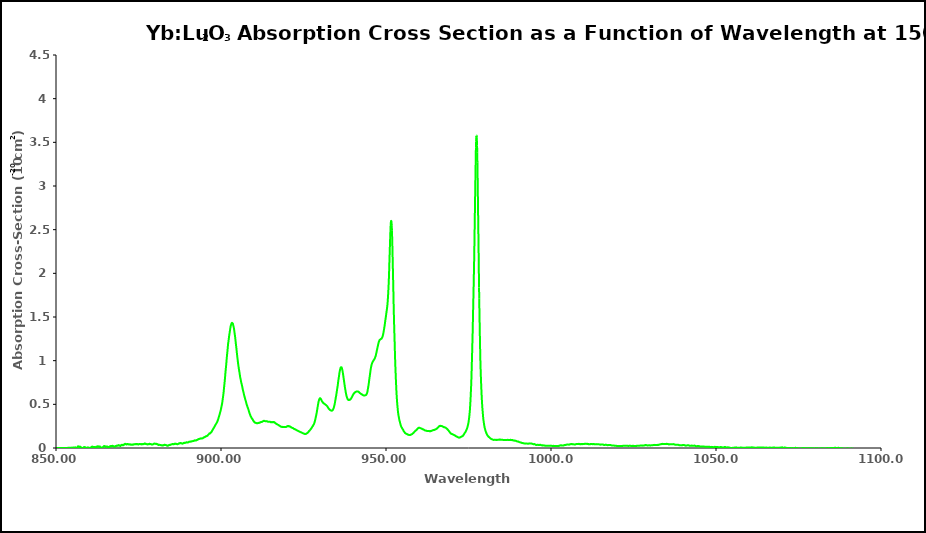
| Category | 150 K |
|---|---|
| 850.0 | 0.002 |
| 850.05 | -0.001 |
| 850.1 | -0.005 |
| 850.15 | -0.011 |
| 850.2 | -0.014 |
| 850.25 | -0.021 |
| 850.3 | -0.023 |
| 850.35 | -0.019 |
| 850.4 | -0.019 |
| 850.45 | -0.02 |
| 850.5 | -0.022 |
| 850.55 | -0.022 |
| 850.6 | -0.021 |
| 850.65 | -0.022 |
| 850.7 | -0.023 |
| 850.75 | -0.025 |
| 850.8 | -0.022 |
| 850.85 | -0.021 |
| 850.9 | -0.022 |
| 850.95 | -0.023 |
| 851.0 | -0.025 |
| 851.05 | -0.023 |
| 851.1 | -0.027 |
| 851.15 | -0.033 |
| 851.2 | -0.033 |
| 851.25 | -0.032 |
| 851.3 | -0.032 |
| 851.35 | -0.031 |
| 851.4 | -0.037 |
| 851.45 | -0.033 |
| 851.5 | -0.032 |
| 851.55 | -0.035 |
| 851.6 | -0.034 |
| 851.65 | -0.029 |
| 851.7 | -0.027 |
| 851.75 | -0.024 |
| 851.8 | -0.021 |
| 851.85 | -0.018 |
| 851.9 | -0.016 |
| 851.95 | -0.012 |
| 852.0 | -0.016 |
| 852.05 | -0.016 |
| 852.1 | -0.012 |
| 852.15 | -0.016 |
| 852.2 | -0.015 |
| 852.25 | -0.014 |
| 852.3 | -0.014 |
| 852.35 | -0.016 |
| 852.4 | -0.015 |
| 852.45 | -0.015 |
| 852.5 | -0.017 |
| 852.55 | -0.016 |
| 852.6 | -0.014 |
| 852.65 | -0.016 |
| 852.7 | -0.013 |
| 852.75 | -0.013 |
| 852.8 | -0.012 |
| 852.85 | -0.012 |
| 852.9 | -0.009 |
| 852.95 | -0.013 |
| 853.0 | -0.017 |
| 853.05 | -0.016 |
| 853.1 | -0.016 |
| 853.15 | -0.015 |
| 853.2 | -0.013 |
| 853.25 | -0.013 |
| 853.3 | -0.019 |
| 853.35 | -0.019 |
| 853.4 | -0.016 |
| 853.45 | -0.019 |
| 853.5 | -0.019 |
| 853.55 | -0.015 |
| 853.6 | -0.017 |
| 853.65 | -0.018 |
| 853.7 | -0.017 |
| 853.75 | -0.015 |
| 853.8 | -0.018 |
| 853.85 | -0.012 |
| 853.9 | -0.013 |
| 853.95 | -0.017 |
| 854.0 | -0.012 |
| 854.05 | -0.01 |
| 854.1 | -0.01 |
| 854.15 | -0.009 |
| 854.2 | -0.011 |
| 854.25 | -0.011 |
| 854.3 | -0.01 |
| 854.35 | -0.007 |
| 854.4 | -0.008 |
| 854.45 | -0.005 |
| 854.5 | -0.005 |
| 854.55 | -0.007 |
| 854.6 | -0.007 |
| 854.65 | -0.005 |
| 854.7 | -0.002 |
| 854.75 | 0.002 |
| 854.8 | 0.003 |
| 854.85 | 0 |
| 854.9 | 0.003 |
| 854.95 | 0.004 |
| 855.0 | 0.003 |
| 855.05 | 0.004 |
| 855.1 | 0.003 |
| 855.15 | 0.005 |
| 855.2 | 0.005 |
| 855.25 | 0.002 |
| 855.3 | 0.001 |
| 855.35 | 0.001 |
| 855.4 | 0.005 |
| 855.45 | 0.003 |
| 855.5 | 0.002 |
| 855.55 | 0.001 |
| 855.6 | 0.001 |
| 855.65 | 0.007 |
| 855.7 | 0.003 |
| 855.75 | 0.005 |
| 855.8 | 0.006 |
| 855.85 | 0.008 |
| 855.9 | 0.006 |
| 855.95 | 0.001 |
| 856.0 | -0.002 |
| 856.05 | 0 |
| 856.1 | 0 |
| 856.15 | -0.001 |
| 856.2 | -0.005 |
| 856.25 | -0.001 |
| 856.3 | -0.001 |
| 856.35 | -0.001 |
| 856.4 | 0.001 |
| 856.45 | 0.004 |
| 856.5 | 0.008 |
| 856.55 | 0.015 |
| 856.6 | 0.015 |
| 856.65 | 0.016 |
| 856.7 | 0.02 |
| 856.75 | 0.016 |
| 856.8 | 0.016 |
| 856.85 | 0.016 |
| 856.9 | 0.018 |
| 856.95 | 0.013 |
| 857.0 | 0.014 |
| 857.05 | 0.014 |
| 857.1 | 0.01 |
| 857.15 | 0.009 |
| 857.2 | 0.01 |
| 857.25 | 0.012 |
| 857.3 | 0.017 |
| 857.35 | 0.013 |
| 857.4 | 0.013 |
| 857.45 | 0.01 |
| 857.5 | 0.011 |
| 857.55 | 0.009 |
| 857.6 | 0.004 |
| 857.65 | 0.004 |
| 857.7 | 0.003 |
| 857.75 | 0.003 |
| 857.8 | -0.006 |
| 857.85 | -0.007 |
| 857.9 | -0.007 |
| 857.95 | -0.008 |
| 858.0 | -0.008 |
| 858.05 | -0.007 |
| 858.1 | -0.004 |
| 858.15 | 0.001 |
| 858.2 | 0.002 |
| 858.25 | 0.001 |
| 858.3 | 0 |
| 858.35 | 0.003 |
| 858.4 | 0.004 |
| 858.45 | 0.007 |
| 858.5 | 0.009 |
| 858.55 | 0.013 |
| 858.6 | 0.011 |
| 858.65 | 0.01 |
| 858.7 | 0.007 |
| 858.75 | 0.005 |
| 858.8 | 0.008 |
| 858.85 | 0.008 |
| 858.9 | 0.008 |
| 858.95 | 0.006 |
| 859.0 | 0.005 |
| 859.05 | -0.002 |
| 859.1 | 0 |
| 859.15 | 0 |
| 859.2 | -0.001 |
| 859.25 | -0.001 |
| 859.3 | -0.002 |
| 859.35 | -0.004 |
| 859.4 | -0.001 |
| 859.45 | 0.002 |
| 859.5 | 0.003 |
| 859.55 | 0.003 |
| 859.6 | 0.007 |
| 859.65 | 0.003 |
| 859.7 | 0.004 |
| 859.75 | 0.002 |
| 859.8 | 0.003 |
| 859.85 | 0.005 |
| 859.9 | 0.005 |
| 859.95 | 0.002 |
| 860.0 | -0.001 |
| 860.05 | 0 |
| 860.1 | 0 |
| 860.15 | -0.002 |
| 860.2 | -0.002 |
| 860.25 | -0.001 |
| 860.3 | 0.002 |
| 860.35 | 0.001 |
| 860.4 | 0.002 |
| 860.45 | 0.003 |
| 860.5 | 0.002 |
| 860.55 | 0.006 |
| 860.6 | 0.007 |
| 860.65 | 0.008 |
| 860.7 | 0.007 |
| 860.75 | 0.011 |
| 860.8 | 0.013 |
| 860.85 | 0.014 |
| 860.9 | 0.014 |
| 860.95 | 0.012 |
| 861.0 | 0.013 |
| 861.05 | 0.016 |
| 861.1 | 0.015 |
| 861.15 | 0.014 |
| 861.2 | 0.012 |
| 861.25 | 0.013 |
| 861.3 | 0.012 |
| 861.35 | 0.009 |
| 861.4 | 0.008 |
| 861.45 | 0.007 |
| 861.5 | 0.011 |
| 861.55 | 0.009 |
| 861.6 | 0.007 |
| 861.65 | 0.008 |
| 861.7 | 0.01 |
| 861.75 | 0.012 |
| 861.8 | 0.01 |
| 861.85 | 0.01 |
| 861.9 | 0.009 |
| 861.95 | 0.01 |
| 862.0 | 0.011 |
| 862.05 | 0.011 |
| 862.1 | 0.013 |
| 862.15 | 0.013 |
| 862.2 | 0.011 |
| 862.25 | 0.01 |
| 862.3 | 0.01 |
| 862.35 | 0.014 |
| 862.4 | 0.014 |
| 862.45 | 0.017 |
| 862.5 | 0.019 |
| 862.55 | 0.019 |
| 862.6 | 0.016 |
| 862.65 | 0.015 |
| 862.7 | 0.016 |
| 862.75 | 0.016 |
| 862.8 | 0.016 |
| 862.85 | 0.017 |
| 862.9 | 0.017 |
| 862.95 | 0.019 |
| 863.0 | 0.015 |
| 863.05 | 0.014 |
| 863.1 | 0.013 |
| 863.15 | 0.014 |
| 863.2 | 0.015 |
| 863.25 | 0.014 |
| 863.3 | 0.018 |
| 863.35 | 0.014 |
| 863.4 | 0.01 |
| 863.45 | 0.008 |
| 863.5 | 0.007 |
| 863.55 | 0.009 |
| 863.6 | 0.007 |
| 863.65 | 0.005 |
| 863.7 | 0.005 |
| 863.75 | 0.001 |
| 863.8 | 0.003 |
| 863.85 | 0 |
| 863.9 | 0.003 |
| 863.95 | 0.005 |
| 864.0 | 0.004 |
| 864.05 | 0.003 |
| 864.1 | 0.005 |
| 864.15 | 0.008 |
| 864.2 | 0.01 |
| 864.25 | 0.012 |
| 864.3 | 0.012 |
| 864.35 | 0.015 |
| 864.4 | 0.018 |
| 864.45 | 0.019 |
| 864.5 | 0.02 |
| 864.55 | 0.021 |
| 864.6 | 0.023 |
| 864.65 | 0.019 |
| 864.7 | 0.018 |
| 864.75 | 0.018 |
| 864.8 | 0.018 |
| 864.85 | 0.019 |
| 864.9 | 0.016 |
| 864.95 | 0.015 |
| 865.0 | 0.015 |
| 865.05 | 0.014 |
| 865.1 | 0.015 |
| 865.15 | 0.016 |
| 865.2 | 0.017 |
| 865.25 | 0.017 |
| 865.3 | 0.017 |
| 865.35 | 0.017 |
| 865.4 | 0.018 |
| 865.45 | 0.016 |
| 865.5 | 0.014 |
| 865.55 | 0.012 |
| 865.6 | 0.016 |
| 865.65 | 0.014 |
| 865.7 | 0.012 |
| 865.75 | 0.011 |
| 865.8 | 0.01 |
| 865.85 | 0.009 |
| 865.9 | 0.011 |
| 865.95 | 0.009 |
| 866.0 | 0.011 |
| 866.05 | 0.012 |
| 866.1 | 0.01 |
| 866.15 | 0.011 |
| 866.2 | 0.011 |
| 866.25 | 0.015 |
| 866.3 | 0.018 |
| 866.35 | 0.018 |
| 866.4 | 0.021 |
| 866.45 | 0.019 |
| 866.5 | 0.021 |
| 866.55 | 0.02 |
| 866.6 | 0.021 |
| 866.65 | 0.024 |
| 866.7 | 0.021 |
| 866.75 | 0.022 |
| 866.8 | 0.021 |
| 866.85 | 0.022 |
| 866.9 | 0.02 |
| 866.95 | 0.021 |
| 867.0 | 0.022 |
| 867.05 | 0.023 |
| 867.1 | 0.025 |
| 867.15 | 0.024 |
| 867.2 | 0.024 |
| 867.25 | 0.024 |
| 867.3 | 0.021 |
| 867.35 | 0.019 |
| 867.4 | 0.017 |
| 867.45 | 0.02 |
| 867.5 | 0.019 |
| 867.55 | 0.015 |
| 867.6 | 0.015 |
| 867.65 | 0.015 |
| 867.7 | 0.016 |
| 867.75 | 0.016 |
| 867.8 | 0.014 |
| 867.85 | 0.017 |
| 867.9 | 0.018 |
| 867.95 | 0.017 |
| 868.0 | 0.019 |
| 868.05 | 0.021 |
| 868.1 | 0.024 |
| 868.15 | 0.023 |
| 868.2 | 0.022 |
| 868.25 | 0.025 |
| 868.3 | 0.024 |
| 868.35 | 0.025 |
| 868.4 | 0.025 |
| 868.45 | 0.027 |
| 868.5 | 0.027 |
| 868.55 | 0.028 |
| 868.6 | 0.026 |
| 868.65 | 0.028 |
| 868.7 | 0.027 |
| 868.75 | 0.029 |
| 868.8 | 0.027 |
| 868.85 | 0.028 |
| 868.9 | 0.028 |
| 868.95 | 0.033 |
| 869.0 | 0.033 |
| 869.05 | 0.033 |
| 869.1 | 0.03 |
| 869.15 | 0.03 |
| 869.2 | 0.027 |
| 869.25 | 0.028 |
| 869.3 | 0.027 |
| 869.35 | 0.026 |
| 869.4 | 0.025 |
| 869.45 | 0.026 |
| 869.5 | 0.024 |
| 869.55 | 0.024 |
| 869.6 | 0.028 |
| 869.65 | 0.031 |
| 869.7 | 0.03 |
| 869.75 | 0.033 |
| 869.8 | 0.033 |
| 869.85 | 0.035 |
| 869.9 | 0.036 |
| 869.95 | 0.036 |
| 870.0 | 0.037 |
| 870.05 | 0.034 |
| 870.1 | 0.032 |
| 870.15 | 0.033 |
| 870.2 | 0.031 |
| 870.25 | 0.033 |
| 870.3 | 0.032 |
| 870.35 | 0.031 |
| 870.4 | 0.032 |
| 870.45 | 0.033 |
| 870.5 | 0.034 |
| 870.55 | 0.036 |
| 870.6 | 0.041 |
| 870.65 | 0.042 |
| 870.7 | 0.041 |
| 870.75 | 0.044 |
| 870.8 | 0.045 |
| 870.85 | 0.046 |
| 870.9 | 0.045 |
| 870.95 | 0.048 |
| 871.0 | 0.047 |
| 871.05 | 0.046 |
| 871.1 | 0.044 |
| 871.15 | 0.042 |
| 871.2 | 0.043 |
| 871.25 | 0.042 |
| 871.3 | 0.041 |
| 871.35 | 0.04 |
| 871.4 | 0.042 |
| 871.45 | 0.045 |
| 871.5 | 0.044 |
| 871.55 | 0.045 |
| 871.6 | 0.047 |
| 871.65 | 0.046 |
| 871.7 | 0.043 |
| 871.75 | 0.044 |
| 871.8 | 0.042 |
| 871.85 | 0.044 |
| 871.9 | 0.044 |
| 871.95 | 0.044 |
| 872.0 | 0.042 |
| 872.05 | 0.04 |
| 872.1 | 0.039 |
| 872.15 | 0.04 |
| 872.2 | 0.039 |
| 872.25 | 0.04 |
| 872.3 | 0.041 |
| 872.35 | 0.043 |
| 872.4 | 0.043 |
| 872.45 | 0.042 |
| 872.5 | 0.039 |
| 872.55 | 0.039 |
| 872.6 | 0.039 |
| 872.65 | 0.038 |
| 872.7 | 0.038 |
| 872.75 | 0.04 |
| 872.8 | 0.041 |
| 872.85 | 0.039 |
| 872.9 | 0.039 |
| 872.95 | 0.037 |
| 873.0 | 0.038 |
| 873.05 | 0.036 |
| 873.1 | 0.039 |
| 873.15 | 0.039 |
| 873.2 | 0.041 |
| 873.25 | 0.039 |
| 873.3 | 0.039 |
| 873.35 | 0.038 |
| 873.4 | 0.039 |
| 873.45 | 0.04 |
| 873.5 | 0.039 |
| 873.55 | 0.04 |
| 873.6 | 0.044 |
| 873.65 | 0.043 |
| 873.7 | 0.044 |
| 873.75 | 0.045 |
| 873.8 | 0.043 |
| 873.85 | 0.043 |
| 873.9 | 0.044 |
| 873.95 | 0.042 |
| 874.0 | 0.042 |
| 874.05 | 0.045 |
| 874.1 | 0.042 |
| 874.15 | 0.043 |
| 874.2 | 0.043 |
| 874.25 | 0.043 |
| 874.3 | 0.042 |
| 874.35 | 0.046 |
| 874.4 | 0.045 |
| 874.45 | 0.046 |
| 874.5 | 0.047 |
| 874.55 | 0.045 |
| 874.6 | 0.045 |
| 874.65 | 0.046 |
| 874.7 | 0.044 |
| 874.75 | 0.044 |
| 874.8 | 0.042 |
| 874.85 | 0.042 |
| 874.9 | 0.039 |
| 874.95 | 0.04 |
| 875.0 | 0.04 |
| 875.05 | 0.043 |
| 875.1 | 0.042 |
| 875.15 | 0.042 |
| 875.2 | 0.044 |
| 875.25 | 0.047 |
| 875.3 | 0.045 |
| 875.35 | 0.047 |
| 875.4 | 0.045 |
| 875.45 | 0.046 |
| 875.5 | 0.046 |
| 875.55 | 0.046 |
| 875.6 | 0.044 |
| 875.65 | 0.044 |
| 875.7 | 0.042 |
| 875.75 | 0.041 |
| 875.8 | 0.042 |
| 875.85 | 0.043 |
| 875.9 | 0.041 |
| 875.95 | 0.044 |
| 876.0 | 0.045 |
| 876.05 | 0.043 |
| 876.1 | 0.045 |
| 876.15 | 0.045 |
| 876.2 | 0.045 |
| 876.25 | 0.045 |
| 876.3 | 0.043 |
| 876.35 | 0.042 |
| 876.4 | 0.043 |
| 876.45 | 0.045 |
| 876.5 | 0.045 |
| 876.55 | 0.045 |
| 876.6 | 0.047 |
| 876.65 | 0.045 |
| 876.7 | 0.046 |
| 876.75 | 0.049 |
| 876.8 | 0.051 |
| 876.85 | 0.053 |
| 876.9 | 0.053 |
| 876.95 | 0.052 |
| 877.0 | 0.052 |
| 877.05 | 0.05 |
| 877.1 | 0.048 |
| 877.15 | 0.046 |
| 877.2 | 0.048 |
| 877.25 | 0.048 |
| 877.3 | 0.045 |
| 877.35 | 0.046 |
| 877.4 | 0.044 |
| 877.45 | 0.044 |
| 877.5 | 0.044 |
| 877.55 | 0.042 |
| 877.6 | 0.042 |
| 877.65 | 0.041 |
| 877.7 | 0.043 |
| 877.75 | 0.041 |
| 877.8 | 0.042 |
| 877.85 | 0.045 |
| 877.9 | 0.045 |
| 877.95 | 0.042 |
| 878.0 | 0.042 |
| 878.05 | 0.042 |
| 878.1 | 0.042 |
| 878.15 | 0.044 |
| 878.2 | 0.046 |
| 878.25 | 0.047 |
| 878.3 | 0.049 |
| 878.35 | 0.047 |
| 878.4 | 0.047 |
| 878.45 | 0.044 |
| 878.5 | 0.046 |
| 878.55 | 0.046 |
| 878.6 | 0.046 |
| 878.65 | 0.047 |
| 878.7 | 0.045 |
| 878.75 | 0.046 |
| 878.8 | 0.042 |
| 878.85 | 0.041 |
| 878.9 | 0.042 |
| 878.95 | 0.04 |
| 879.0 | 0.041 |
| 879.05 | 0.04 |
| 879.1 | 0.041 |
| 879.15 | 0.041 |
| 879.2 | 0.041 |
| 879.25 | 0.041 |
| 879.3 | 0.04 |
| 879.35 | 0.042 |
| 879.4 | 0.044 |
| 879.45 | 0.044 |
| 879.5 | 0.044 |
| 879.55 | 0.046 |
| 879.6 | 0.048 |
| 879.65 | 0.048 |
| 879.7 | 0.049 |
| 879.75 | 0.048 |
| 879.8 | 0.048 |
| 879.85 | 0.05 |
| 879.9 | 0.05 |
| 879.95 | 0.049 |
| 880.0 | 0.049 |
| 880.05 | 0.049 |
| 880.1 | 0.049 |
| 880.15 | 0.048 |
| 880.2 | 0.049 |
| 880.25 | 0.046 |
| 880.3 | 0.047 |
| 880.35 | 0.048 |
| 880.4 | 0.048 |
| 880.45 | 0.048 |
| 880.5 | 0.046 |
| 880.55 | 0.047 |
| 880.6 | 0.046 |
| 880.65 | 0.043 |
| 880.7 | 0.044 |
| 880.75 | 0.042 |
| 880.8 | 0.044 |
| 880.85 | 0.041 |
| 880.9 | 0.039 |
| 880.95 | 0.036 |
| 881.0 | 0.035 |
| 881.05 | 0.034 |
| 881.1 | 0.036 |
| 881.15 | 0.037 |
| 881.2 | 0.038 |
| 881.25 | 0.038 |
| 881.3 | 0.039 |
| 881.35 | 0.036 |
| 881.4 | 0.037 |
| 881.45 | 0.036 |
| 881.5 | 0.036 |
| 881.55 | 0.035 |
| 881.6 | 0.035 |
| 881.65 | 0.034 |
| 881.7 | 0.033 |
| 881.75 | 0.034 |
| 881.8 | 0.032 |
| 881.85 | 0.032 |
| 881.9 | 0.032 |
| 881.95 | 0.032 |
| 882.0 | 0.033 |
| 882.05 | 0.03 |
| 882.1 | 0.03 |
| 882.15 | 0.031 |
| 882.2 | 0.029 |
| 882.25 | 0.031 |
| 882.3 | 0.028 |
| 882.35 | 0.029 |
| 882.4 | 0.029 |
| 882.45 | 0.029 |
| 882.5 | 0.03 |
| 882.55 | 0.031 |
| 882.6 | 0.034 |
| 882.65 | 0.034 |
| 882.7 | 0.033 |
| 882.75 | 0.035 |
| 882.8 | 0.034 |
| 882.85 | 0.037 |
| 882.9 | 0.035 |
| 882.95 | 0.035 |
| 883.0 | 0.037 |
| 883.05 | 0.034 |
| 883.1 | 0.035 |
| 883.15 | 0.034 |
| 883.2 | 0.034 |
| 883.25 | 0.035 |
| 883.3 | 0.033 |
| 883.35 | 0.033 |
| 883.4 | 0.033 |
| 883.45 | 0.032 |
| 883.5 | 0.032 |
| 883.55 | 0.029 |
| 883.6 | 0.029 |
| 883.65 | 0.026 |
| 883.7 | 0.026 |
| 883.75 | 0.026 |
| 883.8 | 0.026 |
| 883.85 | 0.027 |
| 883.9 | 0.028 |
| 883.95 | 0.026 |
| 884.0 | 0.028 |
| 884.05 | 0.03 |
| 884.1 | 0.03 |
| 884.15 | 0.032 |
| 884.2 | 0.032 |
| 884.25 | 0.033 |
| 884.3 | 0.035 |
| 884.35 | 0.035 |
| 884.4 | 0.034 |
| 884.45 | 0.035 |
| 884.5 | 0.036 |
| 884.55 | 0.036 |
| 884.6 | 0.035 |
| 884.65 | 0.037 |
| 884.7 | 0.037 |
| 884.75 | 0.039 |
| 884.8 | 0.039 |
| 884.85 | 0.039 |
| 884.9 | 0.039 |
| 884.95 | 0.041 |
| 885.0 | 0.042 |
| 885.05 | 0.042 |
| 885.1 | 0.043 |
| 885.15 | 0.044 |
| 885.2 | 0.044 |
| 885.25 | 0.045 |
| 885.3 | 0.045 |
| 885.35 | 0.044 |
| 885.4 | 0.045 |
| 885.45 | 0.046 |
| 885.5 | 0.046 |
| 885.55 | 0.045 |
| 885.6 | 0.041 |
| 885.65 | 0.043 |
| 885.7 | 0.044 |
| 885.75 | 0.044 |
| 885.8 | 0.046 |
| 885.85 | 0.047 |
| 885.9 | 0.048 |
| 885.95 | 0.047 |
| 886.0 | 0.047 |
| 886.05 | 0.047 |
| 886.1 | 0.047 |
| 886.15 | 0.05 |
| 886.2 | 0.049 |
| 886.25 | 0.05 |
| 886.3 | 0.048 |
| 886.35 | 0.047 |
| 886.4 | 0.047 |
| 886.45 | 0.047 |
| 886.5 | 0.046 |
| 886.55 | 0.046 |
| 886.6 | 0.045 |
| 886.65 | 0.044 |
| 886.7 | 0.043 |
| 886.75 | 0.042 |
| 886.8 | 0.043 |
| 886.85 | 0.043 |
| 886.9 | 0.045 |
| 886.95 | 0.045 |
| 887.0 | 0.046 |
| 887.05 | 0.047 |
| 887.1 | 0.047 |
| 887.15 | 0.05 |
| 887.2 | 0.052 |
| 887.25 | 0.053 |
| 887.3 | 0.054 |
| 887.35 | 0.052 |
| 887.4 | 0.053 |
| 887.45 | 0.053 |
| 887.5 | 0.053 |
| 887.55 | 0.055 |
| 887.6 | 0.055 |
| 887.65 | 0.057 |
| 887.7 | 0.055 |
| 887.75 | 0.055 |
| 887.8 | 0.054 |
| 887.85 | 0.056 |
| 887.9 | 0.057 |
| 887.95 | 0.055 |
| 888.0 | 0.054 |
| 888.05 | 0.053 |
| 888.1 | 0.051 |
| 888.15 | 0.052 |
| 888.2 | 0.051 |
| 888.25 | 0.05 |
| 888.3 | 0.049 |
| 888.35 | 0.051 |
| 888.4 | 0.051 |
| 888.45 | 0.051 |
| 888.5 | 0.053 |
| 888.55 | 0.053 |
| 888.6 | 0.055 |
| 888.65 | 0.057 |
| 888.7 | 0.057 |
| 888.75 | 0.056 |
| 888.8 | 0.059 |
| 888.85 | 0.06 |
| 888.9 | 0.059 |
| 888.95 | 0.058 |
| 889.0 | 0.058 |
| 889.05 | 0.058 |
| 889.1 | 0.06 |
| 889.15 | 0.059 |
| 889.2 | 0.059 |
| 889.25 | 0.06 |
| 889.3 | 0.06 |
| 889.35 | 0.062 |
| 889.4 | 0.062 |
| 889.45 | 0.064 |
| 889.5 | 0.064 |
| 889.55 | 0.066 |
| 889.6 | 0.066 |
| 889.65 | 0.064 |
| 889.7 | 0.063 |
| 889.75 | 0.062 |
| 889.8 | 0.063 |
| 889.85 | 0.063 |
| 889.9 | 0.062 |
| 889.95 | 0.063 |
| 890.0 | 0.065 |
| 890.05 | 0.066 |
| 890.1 | 0.065 |
| 890.15 | 0.066 |
| 890.2 | 0.068 |
| 890.25 | 0.069 |
| 890.3 | 0.072 |
| 890.35 | 0.071 |
| 890.4 | 0.072 |
| 890.45 | 0.072 |
| 890.5 | 0.071 |
| 890.55 | 0.073 |
| 890.6 | 0.073 |
| 890.65 | 0.074 |
| 890.7 | 0.072 |
| 890.75 | 0.074 |
| 890.8 | 0.075 |
| 890.85 | 0.074 |
| 890.9 | 0.075 |
| 890.95 | 0.076 |
| 891.0 | 0.076 |
| 891.05 | 0.076 |
| 891.1 | 0.075 |
| 891.15 | 0.076 |
| 891.2 | 0.077 |
| 891.25 | 0.079 |
| 891.3 | 0.078 |
| 891.35 | 0.078 |
| 891.4 | 0.078 |
| 891.45 | 0.079 |
| 891.5 | 0.079 |
| 891.55 | 0.08 |
| 891.6 | 0.081 |
| 891.65 | 0.081 |
| 891.7 | 0.081 |
| 891.75 | 0.08 |
| 891.8 | 0.082 |
| 891.85 | 0.084 |
| 891.9 | 0.085 |
| 891.95 | 0.088 |
| 892.0 | 0.086 |
| 892.05 | 0.087 |
| 892.1 | 0.087 |
| 892.15 | 0.085 |
| 892.2 | 0.086 |
| 892.25 | 0.087 |
| 892.3 | 0.088 |
| 892.35 | 0.088 |
| 892.4 | 0.088 |
| 892.45 | 0.087 |
| 892.5 | 0.087 |
| 892.55 | 0.087 |
| 892.6 | 0.088 |
| 892.65 | 0.091 |
| 892.7 | 0.092 |
| 892.75 | 0.091 |
| 892.8 | 0.092 |
| 892.85 | 0.093 |
| 892.9 | 0.095 |
| 892.95 | 0.097 |
| 893.0 | 0.099 |
| 893.05 | 0.097 |
| 893.1 | 0.1 |
| 893.15 | 0.101 |
| 893.2 | 0.1 |
| 893.25 | 0.101 |
| 893.3 | 0.103 |
| 893.35 | 0.104 |
| 893.4 | 0.105 |
| 893.45 | 0.104 |
| 893.5 | 0.104 |
| 893.55 | 0.104 |
| 893.6 | 0.107 |
| 893.65 | 0.106 |
| 893.7 | 0.106 |
| 893.75 | 0.108 |
| 893.8 | 0.109 |
| 893.85 | 0.109 |
| 893.9 | 0.109 |
| 893.95 | 0.11 |
| 894.0 | 0.11 |
| 894.05 | 0.11 |
| 894.1 | 0.11 |
| 894.15 | 0.108 |
| 894.2 | 0.109 |
| 894.25 | 0.109 |
| 894.3 | 0.11 |
| 894.35 | 0.11 |
| 894.4 | 0.11 |
| 894.45 | 0.112 |
| 894.5 | 0.114 |
| 894.55 | 0.114 |
| 894.6 | 0.116 |
| 894.65 | 0.117 |
| 894.7 | 0.12 |
| 894.75 | 0.121 |
| 894.8 | 0.121 |
| 894.85 | 0.121 |
| 894.9 | 0.122 |
| 894.95 | 0.124 |
| 895.0 | 0.125 |
| 895.05 | 0.125 |
| 895.1 | 0.126 |
| 895.15 | 0.127 |
| 895.2 | 0.128 |
| 895.25 | 0.128 |
| 895.3 | 0.129 |
| 895.35 | 0.131 |
| 895.4 | 0.134 |
| 895.45 | 0.134 |
| 895.5 | 0.135 |
| 895.55 | 0.135 |
| 895.6 | 0.136 |
| 895.65 | 0.137 |
| 895.7 | 0.137 |
| 895.75 | 0.138 |
| 895.8 | 0.14 |
| 895.85 | 0.14 |
| 895.9 | 0.141 |
| 895.95 | 0.144 |
| 896.0 | 0.146 |
| 896.05 | 0.149 |
| 896.1 | 0.151 |
| 896.15 | 0.152 |
| 896.2 | 0.154 |
| 896.25 | 0.156 |
| 896.3 | 0.157 |
| 896.35 | 0.159 |
| 896.4 | 0.161 |
| 896.45 | 0.166 |
| 896.5 | 0.165 |
| 896.55 | 0.165 |
| 896.6 | 0.165 |
| 896.65 | 0.169 |
| 896.7 | 0.169 |
| 896.75 | 0.169 |
| 896.8 | 0.172 |
| 896.85 | 0.174 |
| 896.9 | 0.177 |
| 896.95 | 0.178 |
| 897.0 | 0.179 |
| 897.05 | 0.181 |
| 897.1 | 0.182 |
| 897.15 | 0.186 |
| 897.2 | 0.188 |
| 897.25 | 0.193 |
| 897.3 | 0.198 |
| 897.35 | 0.201 |
| 897.4 | 0.204 |
| 897.45 | 0.207 |
| 897.5 | 0.21 |
| 897.55 | 0.212 |
| 897.6 | 0.217 |
| 897.65 | 0.221 |
| 897.7 | 0.223 |
| 897.75 | 0.226 |
| 897.8 | 0.229 |
| 897.85 | 0.231 |
| 897.9 | 0.234 |
| 897.95 | 0.24 |
| 898.0 | 0.242 |
| 898.05 | 0.244 |
| 898.1 | 0.249 |
| 898.15 | 0.253 |
| 898.2 | 0.256 |
| 898.25 | 0.259 |
| 898.3 | 0.263 |
| 898.35 | 0.267 |
| 898.4 | 0.27 |
| 898.45 | 0.273 |
| 898.5 | 0.274 |
| 898.55 | 0.278 |
| 898.6 | 0.282 |
| 898.65 | 0.286 |
| 898.7 | 0.288 |
| 898.75 | 0.293 |
| 898.8 | 0.297 |
| 898.85 | 0.3 |
| 898.9 | 0.303 |
| 898.95 | 0.309 |
| 899.0 | 0.315 |
| 899.05 | 0.32 |
| 899.1 | 0.325 |
| 899.15 | 0.331 |
| 899.2 | 0.337 |
| 899.25 | 0.343 |
| 899.3 | 0.35 |
| 899.35 | 0.356 |
| 899.4 | 0.361 |
| 899.45 | 0.367 |
| 899.5 | 0.375 |
| 899.55 | 0.38 |
| 899.6 | 0.386 |
| 899.65 | 0.394 |
| 899.7 | 0.402 |
| 899.75 | 0.41 |
| 899.8 | 0.415 |
| 899.85 | 0.422 |
| 899.9 | 0.431 |
| 899.95 | 0.439 |
| 900.0 | 0.448 |
| 900.05 | 0.454 |
| 900.1 | 0.465 |
| 900.15 | 0.475 |
| 900.2 | 0.484 |
| 900.25 | 0.493 |
| 900.3 | 0.502 |
| 900.35 | 0.513 |
| 900.4 | 0.524 |
| 900.45 | 0.538 |
| 900.5 | 0.553 |
| 900.55 | 0.567 |
| 900.6 | 0.581 |
| 900.65 | 0.594 |
| 900.7 | 0.61 |
| 900.75 | 0.625 |
| 900.8 | 0.641 |
| 900.85 | 0.66 |
| 900.9 | 0.681 |
| 900.95 | 0.7 |
| 901.0 | 0.719 |
| 901.05 | 0.738 |
| 901.1 | 0.756 |
| 901.15 | 0.776 |
| 901.2 | 0.796 |
| 901.25 | 0.818 |
| 901.3 | 0.842 |
| 901.35 | 0.865 |
| 901.4 | 0.885 |
| 901.45 | 0.905 |
| 901.5 | 0.924 |
| 901.55 | 0.943 |
| 901.6 | 0.963 |
| 901.65 | 0.988 |
| 901.7 | 1.011 |
| 901.75 | 1.033 |
| 901.8 | 1.052 |
| 901.85 | 1.072 |
| 901.9 | 1.091 |
| 901.95 | 1.109 |
| 902.0 | 1.13 |
| 902.05 | 1.151 |
| 902.1 | 1.171 |
| 902.15 | 1.191 |
| 902.2 | 1.205 |
| 902.25 | 1.218 |
| 902.3 | 1.234 |
| 902.35 | 1.247 |
| 902.4 | 1.262 |
| 902.45 | 1.277 |
| 902.5 | 1.292 |
| 902.55 | 1.303 |
| 902.6 | 1.316 |
| 902.65 | 1.33 |
| 902.7 | 1.341 |
| 902.75 | 1.353 |
| 902.8 | 1.365 |
| 902.85 | 1.378 |
| 902.9 | 1.389 |
| 902.95 | 1.399 |
| 903.0 | 1.406 |
| 903.05 | 1.411 |
| 903.1 | 1.418 |
| 903.15 | 1.422 |
| 903.2 | 1.426 |
| 903.25 | 1.43 |
| 903.3 | 1.433 |
| 903.35 | 1.432 |
| 903.4 | 1.431 |
| 903.45 | 1.428 |
| 903.5 | 1.427 |
| 903.55 | 1.425 |
| 903.6 | 1.422 |
| 903.65 | 1.416 |
| 903.7 | 1.406 |
| 903.75 | 1.398 |
| 903.8 | 1.39 |
| 903.85 | 1.382 |
| 903.9 | 1.373 |
| 903.95 | 1.361 |
| 904.0 | 1.349 |
| 904.05 | 1.335 |
| 904.1 | 1.321 |
| 904.15 | 1.306 |
| 904.2 | 1.293 |
| 904.25 | 1.281 |
| 904.3 | 1.264 |
| 904.35 | 1.248 |
| 904.4 | 1.23 |
| 904.45 | 1.213 |
| 904.5 | 1.195 |
| 904.55 | 1.18 |
| 904.6 | 1.163 |
| 904.65 | 1.147 |
| 904.7 | 1.129 |
| 904.75 | 1.111 |
| 904.8 | 1.093 |
| 904.85 | 1.076 |
| 904.9 | 1.058 |
| 904.95 | 1.04 |
| 905.0 | 1.025 |
| 905.05 | 1.009 |
| 905.1 | 0.993 |
| 905.15 | 0.979 |
| 905.2 | 0.964 |
| 905.25 | 0.949 |
| 905.3 | 0.936 |
| 905.35 | 0.924 |
| 905.4 | 0.91 |
| 905.45 | 0.897 |
| 905.5 | 0.888 |
| 905.55 | 0.876 |
| 905.6 | 0.865 |
| 905.65 | 0.852 |
| 905.7 | 0.839 |
| 905.75 | 0.826 |
| 905.8 | 0.815 |
| 905.85 | 0.804 |
| 905.9 | 0.796 |
| 905.95 | 0.787 |
| 906.0 | 0.777 |
| 906.05 | 0.768 |
| 906.1 | 0.757 |
| 906.15 | 0.748 |
| 906.2 | 0.74 |
| 906.25 | 0.733 |
| 906.3 | 0.724 |
| 906.35 | 0.718 |
| 906.4 | 0.709 |
| 906.45 | 0.699 |
| 906.5 | 0.69 |
| 906.55 | 0.682 |
| 906.6 | 0.672 |
| 906.65 | 0.664 |
| 906.7 | 0.656 |
| 906.75 | 0.648 |
| 906.8 | 0.64 |
| 906.85 | 0.632 |
| 906.9 | 0.623 |
| 906.95 | 0.614 |
| 907.0 | 0.607 |
| 907.05 | 0.599 |
| 907.1 | 0.591 |
| 907.15 | 0.585 |
| 907.2 | 0.579 |
| 907.25 | 0.571 |
| 907.3 | 0.564 |
| 907.35 | 0.556 |
| 907.4 | 0.55 |
| 907.45 | 0.544 |
| 907.5 | 0.538 |
| 907.55 | 0.531 |
| 907.6 | 0.523 |
| 907.65 | 0.517 |
| 907.7 | 0.509 |
| 907.75 | 0.503 |
| 907.8 | 0.497 |
| 907.85 | 0.49 |
| 907.9 | 0.486 |
| 907.95 | 0.479 |
| 908.0 | 0.473 |
| 908.05 | 0.468 |
| 908.1 | 0.463 |
| 908.15 | 0.458 |
| 908.2 | 0.454 |
| 908.25 | 0.447 |
| 908.3 | 0.442 |
| 908.35 | 0.436 |
| 908.4 | 0.43 |
| 908.45 | 0.423 |
| 908.5 | 0.417 |
| 908.55 | 0.411 |
| 908.6 | 0.404 |
| 908.65 | 0.398 |
| 908.7 | 0.394 |
| 908.75 | 0.387 |
| 908.8 | 0.384 |
| 908.85 | 0.378 |
| 908.9 | 0.371 |
| 908.95 | 0.367 |
| 909.0 | 0.364 |
| 909.05 | 0.36 |
| 909.1 | 0.356 |
| 909.15 | 0.354 |
| 909.2 | 0.35 |
| 909.25 | 0.346 |
| 909.3 | 0.343 |
| 909.35 | 0.339 |
| 909.4 | 0.336 |
| 909.45 | 0.334 |
| 909.5 | 0.332 |
| 909.55 | 0.329 |
| 909.6 | 0.327 |
| 909.65 | 0.323 |
| 909.7 | 0.319 |
| 909.75 | 0.316 |
| 909.8 | 0.311 |
| 909.85 | 0.309 |
| 909.9 | 0.308 |
| 909.95 | 0.304 |
| 910.0 | 0.302 |
| 910.05 | 0.3 |
| 910.1 | 0.296 |
| 910.15 | 0.294 |
| 910.2 | 0.293 |
| 910.25 | 0.293 |
| 910.3 | 0.291 |
| 910.35 | 0.29 |
| 910.4 | 0.289 |
| 910.45 | 0.289 |
| 910.5 | 0.289 |
| 910.55 | 0.287 |
| 910.6 | 0.286 |
| 910.65 | 0.286 |
| 910.7 | 0.286 |
| 910.75 | 0.285 |
| 910.8 | 0.284 |
| 910.85 | 0.285 |
| 910.9 | 0.284 |
| 910.95 | 0.284 |
| 911.0 | 0.284 |
| 911.05 | 0.283 |
| 911.1 | 0.284 |
| 911.15 | 0.285 |
| 911.2 | 0.286 |
| 911.25 | 0.285 |
| 911.3 | 0.285 |
| 911.35 | 0.286 |
| 911.4 | 0.286 |
| 911.45 | 0.288 |
| 911.5 | 0.288 |
| 911.55 | 0.288 |
| 911.6 | 0.29 |
| 911.65 | 0.29 |
| 911.7 | 0.29 |
| 911.75 | 0.29 |
| 911.8 | 0.291 |
| 911.85 | 0.294 |
| 911.9 | 0.296 |
| 911.95 | 0.296 |
| 912.0 | 0.296 |
| 912.05 | 0.296 |
| 912.1 | 0.298 |
| 912.15 | 0.298 |
| 912.2 | 0.297 |
| 912.25 | 0.298 |
| 912.3 | 0.299 |
| 912.35 | 0.3 |
| 912.4 | 0.299 |
| 912.45 | 0.299 |
| 912.5 | 0.3 |
| 912.55 | 0.303 |
| 912.6 | 0.304 |
| 912.65 | 0.305 |
| 912.7 | 0.306 |
| 912.75 | 0.307 |
| 912.8 | 0.307 |
| 912.85 | 0.309 |
| 912.9 | 0.309 |
| 912.95 | 0.311 |
| 913.0 | 0.312 |
| 913.05 | 0.312 |
| 913.1 | 0.309 |
| 913.15 | 0.309 |
| 913.2 | 0.309 |
| 913.25 | 0.308 |
| 913.3 | 0.309 |
| 913.35 | 0.308 |
| 913.4 | 0.307 |
| 913.45 | 0.307 |
| 913.5 | 0.306 |
| 913.55 | 0.307 |
| 913.6 | 0.307 |
| 913.65 | 0.308 |
| 913.7 | 0.307 |
| 913.75 | 0.307 |
| 913.8 | 0.306 |
| 913.85 | 0.306 |
| 913.9 | 0.306 |
| 913.95 | 0.305 |
| 914.0 | 0.305 |
| 914.05 | 0.305 |
| 914.1 | 0.302 |
| 914.15 | 0.302 |
| 914.2 | 0.302 |
| 914.25 | 0.301 |
| 914.3 | 0.3 |
| 914.35 | 0.301 |
| 914.4 | 0.301 |
| 914.45 | 0.302 |
| 914.5 | 0.302 |
| 914.55 | 0.301 |
| 914.6 | 0.301 |
| 914.65 | 0.301 |
| 914.7 | 0.301 |
| 914.75 | 0.3 |
| 914.8 | 0.3 |
| 914.85 | 0.301 |
| 914.9 | 0.3 |
| 914.95 | 0.299 |
| 915.0 | 0.297 |
| 915.05 | 0.296 |
| 915.1 | 0.295 |
| 915.15 | 0.296 |
| 915.2 | 0.297 |
| 915.25 | 0.296 |
| 915.3 | 0.296 |
| 915.35 | 0.296 |
| 915.4 | 0.295 |
| 915.45 | 0.295 |
| 915.5 | 0.294 |
| 915.55 | 0.296 |
| 915.6 | 0.297 |
| 915.65 | 0.298 |
| 915.7 | 0.296 |
| 915.75 | 0.295 |
| 915.8 | 0.295 |
| 915.85 | 0.296 |
| 915.9 | 0.297 |
| 915.95 | 0.296 |
| 916.0 | 0.297 |
| 916.05 | 0.297 |
| 916.1 | 0.296 |
| 916.15 | 0.294 |
| 916.2 | 0.292 |
| 916.25 | 0.292 |
| 916.3 | 0.292 |
| 916.35 | 0.29 |
| 916.4 | 0.288 |
| 916.45 | 0.285 |
| 916.5 | 0.284 |
| 916.55 | 0.281 |
| 916.6 | 0.28 |
| 916.65 | 0.279 |
| 916.7 | 0.28 |
| 916.75 | 0.279 |
| 916.8 | 0.276 |
| 916.85 | 0.274 |
| 916.9 | 0.273 |
| 916.95 | 0.272 |
| 917.0 | 0.272 |
| 917.05 | 0.271 |
| 917.1 | 0.269 |
| 917.15 | 0.268 |
| 917.2 | 0.267 |
| 917.25 | 0.266 |
| 917.3 | 0.264 |
| 917.35 | 0.264 |
| 917.4 | 0.264 |
| 917.45 | 0.263 |
| 917.5 | 0.26 |
| 917.55 | 0.259 |
| 917.6 | 0.258 |
| 917.65 | 0.257 |
| 917.7 | 0.256 |
| 917.75 | 0.254 |
| 917.8 | 0.252 |
| 917.85 | 0.252 |
| 917.9 | 0.251 |
| 917.95 | 0.249 |
| 918.0 | 0.247 |
| 918.05 | 0.247 |
| 918.1 | 0.245 |
| 918.15 | 0.245 |
| 918.2 | 0.244 |
| 918.25 | 0.244 |
| 918.3 | 0.243 |
| 918.35 | 0.242 |
| 918.4 | 0.241 |
| 918.45 | 0.242 |
| 918.5 | 0.241 |
| 918.55 | 0.241 |
| 918.6 | 0.242 |
| 918.65 | 0.242 |
| 918.7 | 0.241 |
| 918.75 | 0.241 |
| 918.8 | 0.24 |
| 918.85 | 0.24 |
| 918.9 | 0.24 |
| 918.95 | 0.24 |
| 919.0 | 0.239 |
| 919.05 | 0.239 |
| 919.1 | 0.24 |
| 919.15 | 0.24 |
| 919.2 | 0.24 |
| 919.25 | 0.239 |
| 919.3 | 0.24 |
| 919.35 | 0.24 |
| 919.4 | 0.24 |
| 919.45 | 0.239 |
| 919.5 | 0.24 |
| 919.55 | 0.241 |
| 919.6 | 0.24 |
| 919.65 | 0.239 |
| 919.7 | 0.24 |
| 919.75 | 0.241 |
| 919.8 | 0.242 |
| 919.85 | 0.244 |
| 919.9 | 0.245 |
| 919.95 | 0.246 |
| 920.0 | 0.247 |
| 920.05 | 0.248 |
| 920.1 | 0.249 |
| 920.15 | 0.251 |
| 920.2 | 0.252 |
| 920.25 | 0.25 |
| 920.3 | 0.249 |
| 920.35 | 0.25 |
| 920.4 | 0.251 |
| 920.45 | 0.251 |
| 920.5 | 0.252 |
| 920.55 | 0.25 |
| 920.6 | 0.25 |
| 920.65 | 0.248 |
| 920.7 | 0.246 |
| 920.75 | 0.247 |
| 920.8 | 0.247 |
| 920.85 | 0.248 |
| 920.9 | 0.246 |
| 920.95 | 0.243 |
| 921.0 | 0.242 |
| 921.05 | 0.241 |
| 921.1 | 0.241 |
| 921.15 | 0.239 |
| 921.2 | 0.239 |
| 921.25 | 0.238 |
| 921.3 | 0.235 |
| 921.35 | 0.234 |
| 921.4 | 0.233 |
| 921.45 | 0.234 |
| 921.5 | 0.233 |
| 921.55 | 0.232 |
| 921.6 | 0.231 |
| 921.65 | 0.23 |
| 921.7 | 0.229 |
| 921.75 | 0.228 |
| 921.8 | 0.227 |
| 921.85 | 0.227 |
| 921.9 | 0.226 |
| 921.95 | 0.224 |
| 922.0 | 0.222 |
| 922.05 | 0.221 |
| 922.1 | 0.219 |
| 922.15 | 0.218 |
| 922.2 | 0.218 |
| 922.25 | 0.218 |
| 922.3 | 0.217 |
| 922.35 | 0.217 |
| 922.4 | 0.215 |
| 922.45 | 0.213 |
| 922.5 | 0.212 |
| 922.55 | 0.212 |
| 922.6 | 0.211 |
| 922.65 | 0.21 |
| 922.7 | 0.209 |
| 922.75 | 0.208 |
| 922.8 | 0.206 |
| 922.85 | 0.205 |
| 922.9 | 0.204 |
| 922.95 | 0.203 |
| 923.0 | 0.203 |
| 923.05 | 0.201 |
| 923.1 | 0.2 |
| 923.15 | 0.199 |
| 923.2 | 0.199 |
| 923.25 | 0.197 |
| 923.3 | 0.196 |
| 923.35 | 0.196 |
| 923.4 | 0.194 |
| 923.45 | 0.193 |
| 923.5 | 0.192 |
| 923.55 | 0.192 |
| 923.6 | 0.192 |
| 923.65 | 0.191 |
| 923.7 | 0.189 |
| 923.75 | 0.188 |
| 923.8 | 0.187 |
| 923.85 | 0.187 |
| 923.9 | 0.186 |
| 923.95 | 0.185 |
| 924.0 | 0.184 |
| 924.05 | 0.183 |
| 924.1 | 0.182 |
| 924.15 | 0.181 |
| 924.2 | 0.18 |
| 924.25 | 0.18 |
| 924.3 | 0.179 |
| 924.35 | 0.178 |
| 924.4 | 0.177 |
| 924.45 | 0.177 |
| 924.5 | 0.175 |
| 924.55 | 0.174 |
| 924.6 | 0.173 |
| 924.65 | 0.172 |
| 924.7 | 0.171 |
| 924.75 | 0.17 |
| 924.8 | 0.169 |
| 924.85 | 0.168 |
| 924.9 | 0.168 |
| 924.95 | 0.167 |
| 925.0 | 0.166 |
| 925.05 | 0.165 |
| 925.1 | 0.166 |
| 925.15 | 0.164 |
| 925.2 | 0.164 |
| 925.25 | 0.163 |
| 925.3 | 0.161 |
| 925.35 | 0.16 |
| 925.4 | 0.16 |
| 925.45 | 0.16 |
| 925.5 | 0.159 |
| 925.55 | 0.16 |
| 925.6 | 0.16 |
| 925.65 | 0.161 |
| 925.7 | 0.161 |
| 925.75 | 0.161 |
| 925.8 | 0.162 |
| 925.85 | 0.165 |
| 925.9 | 0.167 |
| 925.95 | 0.166 |
| 926.0 | 0.167 |
| 926.05 | 0.168 |
| 926.1 | 0.169 |
| 926.15 | 0.171 |
| 926.2 | 0.172 |
| 926.25 | 0.175 |
| 926.3 | 0.177 |
| 926.35 | 0.179 |
| 926.4 | 0.18 |
| 926.45 | 0.18 |
| 926.5 | 0.183 |
| 926.55 | 0.187 |
| 926.6 | 0.19 |
| 926.65 | 0.193 |
| 926.7 | 0.195 |
| 926.75 | 0.195 |
| 926.8 | 0.197 |
| 926.85 | 0.199 |
| 926.9 | 0.201 |
| 926.95 | 0.204 |
| 927.0 | 0.207 |
| 927.05 | 0.211 |
| 927.1 | 0.211 |
| 927.15 | 0.213 |
| 927.2 | 0.215 |
| 927.25 | 0.217 |
| 927.3 | 0.221 |
| 927.35 | 0.224 |
| 927.4 | 0.227 |
| 927.45 | 0.23 |
| 927.5 | 0.233 |
| 927.55 | 0.236 |
| 927.6 | 0.238 |
| 927.65 | 0.242 |
| 927.7 | 0.245 |
| 927.75 | 0.248 |
| 927.8 | 0.251 |
| 927.85 | 0.253 |
| 927.9 | 0.256 |
| 927.95 | 0.26 |
| 928.0 | 0.263 |
| 928.05 | 0.267 |
| 928.1 | 0.27 |
| 928.15 | 0.273 |
| 928.2 | 0.277 |
| 928.25 | 0.284 |
| 928.3 | 0.288 |
| 928.35 | 0.295 |
| 928.4 | 0.302 |
| 928.45 | 0.309 |
| 928.5 | 0.315 |
| 928.55 | 0.322 |
| 928.6 | 0.33 |
| 928.65 | 0.339 |
| 928.7 | 0.349 |
| 928.75 | 0.358 |
| 928.8 | 0.366 |
| 928.85 | 0.375 |
| 928.9 | 0.384 |
| 928.95 | 0.393 |
| 929.0 | 0.403 |
| 929.05 | 0.416 |
| 929.1 | 0.428 |
| 929.15 | 0.439 |
| 929.2 | 0.45 |
| 929.25 | 0.462 |
| 929.3 | 0.474 |
| 929.35 | 0.485 |
| 929.4 | 0.496 |
| 929.45 | 0.507 |
| 929.5 | 0.518 |
| 929.55 | 0.527 |
| 929.6 | 0.535 |
| 929.65 | 0.542 |
| 929.7 | 0.549 |
| 929.75 | 0.554 |
| 929.8 | 0.559 |
| 929.85 | 0.563 |
| 929.9 | 0.566 |
| 929.95 | 0.569 |
| 930.0 | 0.57 |
| 930.05 | 0.569 |
| 930.1 | 0.569 |
| 930.15 | 0.567 |
| 930.2 | 0.565 |
| 930.25 | 0.561 |
| 930.3 | 0.559 |
| 930.35 | 0.554 |
| 930.4 | 0.551 |
| 930.45 | 0.547 |
| 930.5 | 0.542 |
| 930.55 | 0.538 |
| 930.6 | 0.535 |
| 930.65 | 0.532 |
| 930.7 | 0.531 |
| 930.75 | 0.527 |
| 930.8 | 0.525 |
| 930.85 | 0.522 |
| 930.9 | 0.52 |
| 930.95 | 0.516 |
| 931.0 | 0.515 |
| 931.05 | 0.515 |
| 931.1 | 0.514 |
| 931.15 | 0.512 |
| 931.2 | 0.51 |
| 931.25 | 0.506 |
| 931.3 | 0.506 |
| 931.35 | 0.505 |
| 931.4 | 0.504 |
| 931.45 | 0.503 |
| 931.5 | 0.502 |
| 931.55 | 0.5 |
| 931.6 | 0.498 |
| 931.65 | 0.497 |
| 931.7 | 0.494 |
| 931.75 | 0.493 |
| 931.8 | 0.493 |
| 931.85 | 0.491 |
| 931.9 | 0.49 |
| 931.95 | 0.488 |
| 932.0 | 0.485 |
| 932.05 | 0.484 |
| 932.1 | 0.482 |
| 932.15 | 0.48 |
| 932.2 | 0.477 |
| 932.25 | 0.475 |
| 932.3 | 0.472 |
| 932.35 | 0.469 |
| 932.4 | 0.465 |
| 932.45 | 0.461 |
| 932.5 | 0.457 |
| 932.55 | 0.455 |
| 932.6 | 0.453 |
| 932.65 | 0.45 |
| 932.7 | 0.449 |
| 932.75 | 0.447 |
| 932.8 | 0.444 |
| 932.85 | 0.442 |
| 932.9 | 0.44 |
| 932.95 | 0.439 |
| 933.0 | 0.437 |
| 933.05 | 0.436 |
| 933.1 | 0.434 |
| 933.15 | 0.432 |
| 933.2 | 0.432 |
| 933.25 | 0.431 |
| 933.3 | 0.43 |
| 933.35 | 0.43 |
| 933.4 | 0.429 |
| 933.45 | 0.428 |
| 933.5 | 0.427 |
| 933.55 | 0.427 |
| 933.6 | 0.427 |
| 933.65 | 0.428 |
| 933.7 | 0.43 |
| 933.75 | 0.43 |
| 933.8 | 0.433 |
| 933.85 | 0.434 |
| 933.9 | 0.437 |
| 933.95 | 0.44 |
| 934.0 | 0.444 |
| 934.05 | 0.448 |
| 934.1 | 0.454 |
| 934.15 | 0.46 |
| 934.2 | 0.465 |
| 934.25 | 0.472 |
| 934.3 | 0.48 |
| 934.35 | 0.487 |
| 934.4 | 0.495 |
| 934.45 | 0.503 |
| 934.5 | 0.513 |
| 934.55 | 0.526 |
| 934.6 | 0.536 |
| 934.65 | 0.546 |
| 934.7 | 0.558 |
| 934.75 | 0.569 |
| 934.8 | 0.58 |
| 934.85 | 0.589 |
| 934.9 | 0.601 |
| 934.95 | 0.612 |
| 935.0 | 0.625 |
| 935.05 | 0.637 |
| 935.1 | 0.649 |
| 935.15 | 0.662 |
| 935.2 | 0.675 |
| 935.25 | 0.687 |
| 935.3 | 0.698 |
| 935.35 | 0.711 |
| 935.4 | 0.725 |
| 935.45 | 0.74 |
| 935.5 | 0.756 |
| 935.55 | 0.77 |
| 935.6 | 0.783 |
| 935.65 | 0.796 |
| 935.7 | 0.808 |
| 935.75 | 0.821 |
| 935.8 | 0.835 |
| 935.85 | 0.849 |
| 935.9 | 0.862 |
| 935.95 | 0.874 |
| 936.0 | 0.883 |
| 936.05 | 0.891 |
| 936.1 | 0.899 |
| 936.15 | 0.906 |
| 936.2 | 0.913 |
| 936.25 | 0.92 |
| 936.3 | 0.923 |
| 936.35 | 0.924 |
| 936.4 | 0.925 |
| 936.45 | 0.925 |
| 936.5 | 0.923 |
| 936.55 | 0.922 |
| 936.6 | 0.918 |
| 936.65 | 0.912 |
| 936.7 | 0.904 |
| 936.75 | 0.897 |
| 936.8 | 0.886 |
| 936.85 | 0.877 |
| 936.9 | 0.867 |
| 936.95 | 0.855 |
| 937.0 | 0.843 |
| 937.05 | 0.829 |
| 937.1 | 0.815 |
| 937.15 | 0.801 |
| 937.2 | 0.788 |
| 937.25 | 0.777 |
| 937.3 | 0.763 |
| 937.35 | 0.75 |
| 937.4 | 0.736 |
| 937.45 | 0.723 |
| 937.5 | 0.709 |
| 937.55 | 0.696 |
| 937.6 | 0.684 |
| 937.65 | 0.673 |
| 937.7 | 0.662 |
| 937.75 | 0.65 |
| 937.8 | 0.64 |
| 937.85 | 0.63 |
| 937.9 | 0.62 |
| 937.95 | 0.611 |
| 938.0 | 0.601 |
| 938.05 | 0.595 |
| 938.1 | 0.589 |
| 938.15 | 0.582 |
| 938.2 | 0.576 |
| 938.25 | 0.57 |
| 938.3 | 0.566 |
| 938.35 | 0.561 |
| 938.4 | 0.557 |
| 938.45 | 0.555 |
| 938.5 | 0.554 |
| 938.55 | 0.553 |
| 938.6 | 0.552 |
| 938.65 | 0.549 |
| 938.7 | 0.549 |
| 938.75 | 0.549 |
| 938.8 | 0.549 |
| 938.85 | 0.548 |
| 938.9 | 0.55 |
| 938.95 | 0.551 |
| 939.0 | 0.551 |
| 939.05 | 0.552 |
| 939.1 | 0.552 |
| 939.15 | 0.554 |
| 939.2 | 0.558 |
| 939.25 | 0.56 |
| 939.3 | 0.561 |
| 939.35 | 0.563 |
| 939.4 | 0.565 |
| 939.45 | 0.569 |
| 939.5 | 0.572 |
| 939.55 | 0.576 |
| 939.6 | 0.579 |
| 939.65 | 0.581 |
| 939.7 | 0.585 |
| 939.75 | 0.588 |
| 939.8 | 0.593 |
| 939.85 | 0.597 |
| 939.9 | 0.601 |
| 939.95 | 0.605 |
| 940.0 | 0.608 |
| 940.05 | 0.611 |
| 940.1 | 0.615 |
| 940.15 | 0.619 |
| 940.2 | 0.622 |
| 940.25 | 0.623 |
| 940.3 | 0.627 |
| 940.35 | 0.628 |
| 940.4 | 0.629 |
| 940.45 | 0.632 |
| 940.5 | 0.634 |
| 940.55 | 0.636 |
| 940.6 | 0.638 |
| 940.65 | 0.638 |
| 940.7 | 0.639 |
| 940.75 | 0.641 |
| 940.8 | 0.642 |
| 940.85 | 0.643 |
| 940.9 | 0.644 |
| 940.95 | 0.646 |
| 941.0 | 0.646 |
| 941.05 | 0.646 |
| 941.1 | 0.646 |
| 941.15 | 0.646 |
| 941.2 | 0.646 |
| 941.25 | 0.647 |
| 941.3 | 0.647 |
| 941.35 | 0.648 |
| 941.4 | 0.648 |
| 941.45 | 0.648 |
| 941.5 | 0.647 |
| 941.55 | 0.646 |
| 941.6 | 0.646 |
| 941.65 | 0.644 |
| 941.7 | 0.643 |
| 941.75 | 0.642 |
| 941.8 | 0.64 |
| 941.85 | 0.639 |
| 941.9 | 0.637 |
| 941.95 | 0.634 |
| 942.0 | 0.632 |
| 942.05 | 0.63 |
| 942.1 | 0.628 |
| 942.15 | 0.628 |
| 942.2 | 0.627 |
| 942.25 | 0.625 |
| 942.3 | 0.623 |
| 942.35 | 0.622 |
| 942.4 | 0.62 |
| 942.45 | 0.619 |
| 942.5 | 0.618 |
| 942.55 | 0.618 |
| 942.6 | 0.617 |
| 942.65 | 0.615 |
| 942.7 | 0.613 |
| 942.75 | 0.612 |
| 942.8 | 0.611 |
| 942.85 | 0.61 |
| 942.9 | 0.607 |
| 942.95 | 0.607 |
| 943.0 | 0.605 |
| 943.05 | 0.605 |
| 943.1 | 0.603 |
| 943.15 | 0.603 |
| 943.2 | 0.603 |
| 943.25 | 0.601 |
| 943.3 | 0.6 |
| 943.35 | 0.6 |
| 943.4 | 0.6 |
| 943.45 | 0.601 |
| 943.5 | 0.601 |
| 943.55 | 0.602 |
| 943.6 | 0.602 |
| 943.65 | 0.603 |
| 943.7 | 0.603 |
| 943.75 | 0.603 |
| 943.8 | 0.605 |
| 943.85 | 0.605 |
| 943.9 | 0.605 |
| 943.95 | 0.608 |
| 944.0 | 0.609 |
| 944.05 | 0.612 |
| 944.1 | 0.615 |
| 944.15 | 0.619 |
| 944.2 | 0.622 |
| 944.25 | 0.628 |
| 944.3 | 0.634 |
| 944.35 | 0.641 |
| 944.4 | 0.651 |
| 944.45 | 0.662 |
| 944.5 | 0.673 |
| 944.55 | 0.685 |
| 944.6 | 0.695 |
| 944.65 | 0.707 |
| 944.7 | 0.719 |
| 944.75 | 0.731 |
| 944.8 | 0.744 |
| 944.85 | 0.76 |
| 944.9 | 0.775 |
| 944.95 | 0.789 |
| 945.0 | 0.803 |
| 945.05 | 0.815 |
| 945.1 | 0.829 |
| 945.15 | 0.844 |
| 945.2 | 0.857 |
| 945.25 | 0.871 |
| 945.3 | 0.886 |
| 945.35 | 0.899 |
| 945.4 | 0.91 |
| 945.45 | 0.92 |
| 945.5 | 0.93 |
| 945.55 | 0.939 |
| 945.6 | 0.948 |
| 945.65 | 0.954 |
| 945.7 | 0.961 |
| 945.75 | 0.967 |
| 945.8 | 0.973 |
| 945.85 | 0.977 |
| 945.9 | 0.982 |
| 945.95 | 0.986 |
| 946.0 | 0.989 |
| 946.05 | 0.992 |
| 946.1 | 0.994 |
| 946.15 | 0.998 |
| 946.2 | 1.002 |
| 946.25 | 1.005 |
| 946.3 | 1.008 |
| 946.35 | 1.011 |
| 946.4 | 1.014 |
| 946.45 | 1.015 |
| 946.5 | 1.018 |
| 946.55 | 1.022 |
| 946.6 | 1.026 |
| 946.65 | 1.032 |
| 946.7 | 1.037 |
| 946.75 | 1.042 |
| 946.8 | 1.047 |
| 946.85 | 1.052 |
| 946.9 | 1.059 |
| 946.95 | 1.067 |
| 947.0 | 1.077 |
| 947.05 | 1.085 |
| 947.1 | 1.093 |
| 947.15 | 1.102 |
| 947.2 | 1.111 |
| 947.25 | 1.119 |
| 947.3 | 1.128 |
| 947.35 | 1.137 |
| 947.4 | 1.147 |
| 947.45 | 1.155 |
| 947.5 | 1.164 |
| 947.55 | 1.172 |
| 947.6 | 1.182 |
| 947.65 | 1.19 |
| 947.7 | 1.196 |
| 947.75 | 1.204 |
| 947.8 | 1.211 |
| 947.85 | 1.217 |
| 947.9 | 1.223 |
| 947.95 | 1.227 |
| 948.0 | 1.232 |
| 948.05 | 1.235 |
| 948.1 | 1.238 |
| 948.15 | 1.239 |
| 948.2 | 1.241 |
| 948.25 | 1.242 |
| 948.3 | 1.243 |
| 948.35 | 1.245 |
| 948.4 | 1.246 |
| 948.45 | 1.248 |
| 948.5 | 1.25 |
| 948.55 | 1.25 |
| 948.6 | 1.252 |
| 948.65 | 1.253 |
| 948.7 | 1.255 |
| 948.75 | 1.259 |
| 948.8 | 1.262 |
| 948.85 | 1.267 |
| 948.9 | 1.271 |
| 948.95 | 1.276 |
| 949.0 | 1.282 |
| 949.05 | 1.289 |
| 949.1 | 1.296 |
| 949.15 | 1.305 |
| 949.2 | 1.315 |
| 949.25 | 1.325 |
| 949.3 | 1.336 |
| 949.35 | 1.346 |
| 949.4 | 1.357 |
| 949.45 | 1.369 |
| 949.5 | 1.382 |
| 949.55 | 1.393 |
| 949.6 | 1.405 |
| 949.65 | 1.42 |
| 949.7 | 1.435 |
| 949.75 | 1.449 |
| 949.8 | 1.463 |
| 949.85 | 1.476 |
| 949.9 | 1.488 |
| 949.95 | 1.501 |
| 950.0 | 1.515 |
| 950.05 | 1.528 |
| 950.1 | 1.543 |
| 950.15 | 1.557 |
| 950.2 | 1.57 |
| 950.25 | 1.584 |
| 950.3 | 1.597 |
| 950.35 | 1.613 |
| 950.4 | 1.63 |
| 950.45 | 1.647 |
| 950.5 | 1.672 |
| 950.55 | 1.699 |
| 950.6 | 1.729 |
| 950.65 | 1.759 |
| 950.7 | 1.794 |
| 950.75 | 1.833 |
| 950.8 | 1.872 |
| 950.85 | 1.916 |
| 950.9 | 1.968 |
| 950.95 | 2.028 |
| 951.0 | 2.093 |
| 951.05 | 2.154 |
| 951.1 | 2.213 |
| 951.15 | 2.272 |
| 951.2 | 2.331 |
| 951.25 | 2.39 |
| 951.3 | 2.444 |
| 951.35 | 2.495 |
| 951.4 | 2.541 |
| 951.45 | 2.573 |
| 951.5 | 2.59 |
| 951.55 | 2.6 |
| 951.6 | 2.598 |
| 951.65 | 2.59 |
| 951.7 | 2.57 |
| 951.75 | 2.545 |
| 951.8 | 2.494 |
| 951.85 | 2.433 |
| 951.9 | 2.363 |
| 951.95 | 2.286 |
| 952.0 | 2.202 |
| 952.05 | 2.113 |
| 952.1 | 2.026 |
| 952.15 | 1.941 |
| 952.2 | 1.859 |
| 952.25 | 1.766 |
| 952.3 | 1.669 |
| 952.35 | 1.587 |
| 952.4 | 1.507 |
| 952.45 | 1.434 |
| 952.5 | 1.366 |
| 952.55 | 1.299 |
| 952.6 | 1.238 |
| 952.65 | 1.171 |
| 952.7 | 1.099 |
| 952.75 | 1.031 |
| 952.8 | 0.975 |
| 952.85 | 0.923 |
| 952.9 | 0.874 |
| 952.95 | 0.827 |
| 953.0 | 0.779 |
| 953.05 | 0.737 |
| 953.1 | 0.695 |
| 953.15 | 0.654 |
| 953.2 | 0.619 |
| 953.25 | 0.59 |
| 953.3 | 0.56 |
| 953.35 | 0.534 |
| 953.4 | 0.509 |
| 953.45 | 0.487 |
| 953.5 | 0.467 |
| 953.55 | 0.448 |
| 953.6 | 0.426 |
| 953.65 | 0.409 |
| 953.7 | 0.395 |
| 953.75 | 0.383 |
| 953.8 | 0.371 |
| 953.85 | 0.361 |
| 953.9 | 0.351 |
| 953.95 | 0.342 |
| 954.0 | 0.33 |
| 954.05 | 0.32 |
| 954.1 | 0.312 |
| 954.15 | 0.305 |
| 954.2 | 0.299 |
| 954.25 | 0.291 |
| 954.3 | 0.283 |
| 954.35 | 0.276 |
| 954.4 | 0.269 |
| 954.45 | 0.263 |
| 954.5 | 0.256 |
| 954.55 | 0.251 |
| 954.6 | 0.246 |
| 954.65 | 0.243 |
| 954.7 | 0.239 |
| 954.75 | 0.235 |
| 954.8 | 0.232 |
| 954.85 | 0.229 |
| 954.9 | 0.225 |
| 954.95 | 0.221 |
| 955.0 | 0.219 |
| 955.05 | 0.216 |
| 955.1 | 0.213 |
| 955.15 | 0.211 |
| 955.2 | 0.207 |
| 955.25 | 0.202 |
| 955.3 | 0.198 |
| 955.35 | 0.194 |
| 955.4 | 0.192 |
| 955.45 | 0.19 |
| 955.5 | 0.187 |
| 955.55 | 0.184 |
| 955.6 | 0.181 |
| 955.65 | 0.178 |
| 955.7 | 0.175 |
| 955.75 | 0.172 |
| 955.8 | 0.171 |
| 955.85 | 0.171 |
| 955.9 | 0.17 |
| 955.95 | 0.167 |
| 956.0 | 0.166 |
| 956.05 | 0.165 |
| 956.1 | 0.164 |
| 956.15 | 0.164 |
| 956.2 | 0.163 |
| 956.25 | 0.162 |
| 956.3 | 0.161 |
| 956.35 | 0.16 |
| 956.4 | 0.159 |
| 956.45 | 0.157 |
| 956.5 | 0.157 |
| 956.55 | 0.155 |
| 956.6 | 0.154 |
| 956.65 | 0.152 |
| 956.7 | 0.151 |
| 956.75 | 0.15 |
| 956.8 | 0.151 |
| 956.85 | 0.151 |
| 956.9 | 0.15 |
| 956.95 | 0.149 |
| 957.0 | 0.149 |
| 957.05 | 0.149 |
| 957.1 | 0.148 |
| 957.15 | 0.149 |
| 957.2 | 0.15 |
| 957.25 | 0.15 |
| 957.3 | 0.15 |
| 957.35 | 0.15 |
| 957.4 | 0.15 |
| 957.45 | 0.15 |
| 957.5 | 0.152 |
| 957.55 | 0.152 |
| 957.6 | 0.154 |
| 957.65 | 0.155 |
| 957.7 | 0.156 |
| 957.75 | 0.156 |
| 957.8 | 0.157 |
| 957.85 | 0.158 |
| 957.9 | 0.159 |
| 957.95 | 0.161 |
| 958.0 | 0.163 |
| 958.05 | 0.164 |
| 958.1 | 0.166 |
| 958.15 | 0.168 |
| 958.2 | 0.169 |
| 958.25 | 0.17 |
| 958.3 | 0.172 |
| 958.35 | 0.174 |
| 958.4 | 0.176 |
| 958.45 | 0.179 |
| 958.5 | 0.181 |
| 958.55 | 0.183 |
| 958.6 | 0.185 |
| 958.65 | 0.187 |
| 958.7 | 0.188 |
| 958.75 | 0.19 |
| 958.8 | 0.192 |
| 958.85 | 0.195 |
| 958.9 | 0.198 |
| 958.95 | 0.199 |
| 959.0 | 0.2 |
| 959.05 | 0.201 |
| 959.1 | 0.202 |
| 959.15 | 0.203 |
| 959.2 | 0.205 |
| 959.25 | 0.206 |
| 959.3 | 0.21 |
| 959.35 | 0.212 |
| 959.4 | 0.213 |
| 959.45 | 0.215 |
| 959.5 | 0.217 |
| 959.55 | 0.219 |
| 959.6 | 0.222 |
| 959.65 | 0.225 |
| 959.7 | 0.226 |
| 959.75 | 0.229 |
| 959.8 | 0.23 |
| 959.85 | 0.229 |
| 959.9 | 0.231 |
| 959.95 | 0.232 |
| 960.0 | 0.233 |
| 960.05 | 0.233 |
| 960.1 | 0.233 |
| 960.15 | 0.232 |
| 960.2 | 0.231 |
| 960.25 | 0.23 |
| 960.3 | 0.23 |
| 960.35 | 0.228 |
| 960.4 | 0.228 |
| 960.45 | 0.228 |
| 960.5 | 0.226 |
| 960.55 | 0.226 |
| 960.6 | 0.224 |
| 960.65 | 0.224 |
| 960.7 | 0.223 |
| 960.75 | 0.222 |
| 960.8 | 0.221 |
| 960.85 | 0.22 |
| 960.9 | 0.22 |
| 960.95 | 0.218 |
| 961.0 | 0.217 |
| 961.05 | 0.215 |
| 961.1 | 0.214 |
| 961.15 | 0.214 |
| 961.2 | 0.214 |
| 961.25 | 0.215 |
| 961.3 | 0.213 |
| 961.35 | 0.212 |
| 961.4 | 0.211 |
| 961.45 | 0.209 |
| 961.5 | 0.209 |
| 961.55 | 0.208 |
| 961.6 | 0.206 |
| 961.65 | 0.205 |
| 961.7 | 0.203 |
| 961.75 | 0.202 |
| 961.8 | 0.2 |
| 961.85 | 0.201 |
| 961.9 | 0.201 |
| 961.95 | 0.2 |
| 962.0 | 0.2 |
| 962.05 | 0.2 |
| 962.1 | 0.199 |
| 962.15 | 0.199 |
| 962.2 | 0.198 |
| 962.25 | 0.197 |
| 962.3 | 0.196 |
| 962.35 | 0.195 |
| 962.4 | 0.195 |
| 962.45 | 0.194 |
| 962.5 | 0.194 |
| 962.55 | 0.194 |
| 962.6 | 0.194 |
| 962.65 | 0.194 |
| 962.7 | 0.195 |
| 962.75 | 0.195 |
| 962.8 | 0.195 |
| 962.85 | 0.193 |
| 962.9 | 0.194 |
| 962.95 | 0.193 |
| 963.0 | 0.194 |
| 963.05 | 0.193 |
| 963.1 | 0.193 |
| 963.15 | 0.193 |
| 963.2 | 0.192 |
| 963.25 | 0.192 |
| 963.3 | 0.192 |
| 963.35 | 0.192 |
| 963.4 | 0.194 |
| 963.45 | 0.194 |
| 963.5 | 0.194 |
| 963.55 | 0.193 |
| 963.6 | 0.193 |
| 963.65 | 0.194 |
| 963.7 | 0.194 |
| 963.75 | 0.195 |
| 963.8 | 0.196 |
| 963.85 | 0.197 |
| 963.9 | 0.198 |
| 963.95 | 0.199 |
| 964.0 | 0.199 |
| 964.05 | 0.201 |
| 964.1 | 0.202 |
| 964.15 | 0.203 |
| 964.2 | 0.203 |
| 964.25 | 0.204 |
| 964.3 | 0.204 |
| 964.35 | 0.205 |
| 964.4 | 0.205 |
| 964.45 | 0.205 |
| 964.5 | 0.205 |
| 964.55 | 0.206 |
| 964.6 | 0.206 |
| 964.65 | 0.208 |
| 964.7 | 0.209 |
| 964.75 | 0.21 |
| 964.8 | 0.21 |
| 964.85 | 0.211 |
| 964.9 | 0.211 |
| 964.95 | 0.211 |
| 965.0 | 0.212 |
| 965.05 | 0.214 |
| 965.1 | 0.215 |
| 965.15 | 0.216 |
| 965.2 | 0.217 |
| 965.25 | 0.218 |
| 965.3 | 0.219 |
| 965.35 | 0.221 |
| 965.4 | 0.222 |
| 965.45 | 0.224 |
| 965.5 | 0.226 |
| 965.55 | 0.228 |
| 965.6 | 0.23 |
| 965.65 | 0.231 |
| 965.7 | 0.233 |
| 965.75 | 0.234 |
| 965.8 | 0.237 |
| 965.85 | 0.239 |
| 965.9 | 0.24 |
| 965.95 | 0.243 |
| 966.0 | 0.245 |
| 966.05 | 0.247 |
| 966.1 | 0.249 |
| 966.15 | 0.25 |
| 966.2 | 0.252 |
| 966.25 | 0.253 |
| 966.3 | 0.253 |
| 966.35 | 0.253 |
| 966.4 | 0.255 |
| 966.45 | 0.254 |
| 966.5 | 0.253 |
| 966.55 | 0.253 |
| 966.6 | 0.252 |
| 966.65 | 0.252 |
| 966.7 | 0.252 |
| 966.75 | 0.252 |
| 966.8 | 0.252 |
| 966.85 | 0.252 |
| 966.9 | 0.251 |
| 966.95 | 0.25 |
| 967.0 | 0.25 |
| 967.05 | 0.25 |
| 967.1 | 0.249 |
| 967.15 | 0.248 |
| 967.2 | 0.246 |
| 967.25 | 0.245 |
| 967.3 | 0.243 |
| 967.35 | 0.243 |
| 967.4 | 0.241 |
| 967.45 | 0.24 |
| 967.5 | 0.24 |
| 967.55 | 0.238 |
| 967.6 | 0.238 |
| 967.65 | 0.238 |
| 967.7 | 0.237 |
| 967.75 | 0.238 |
| 967.8 | 0.237 |
| 967.85 | 0.236 |
| 967.9 | 0.234 |
| 967.95 | 0.234 |
| 968.0 | 0.233 |
| 968.05 | 0.232 |
| 968.1 | 0.232 |
| 968.15 | 0.23 |
| 968.2 | 0.229 |
| 968.25 | 0.226 |
| 968.3 | 0.225 |
| 968.35 | 0.224 |
| 968.4 | 0.222 |
| 968.45 | 0.221 |
| 968.5 | 0.22 |
| 968.55 | 0.218 |
| 968.6 | 0.215 |
| 968.65 | 0.212 |
| 968.7 | 0.211 |
| 968.75 | 0.208 |
| 968.8 | 0.207 |
| 968.85 | 0.205 |
| 968.9 | 0.203 |
| 968.95 | 0.2 |
| 969.0 | 0.197 |
| 969.05 | 0.194 |
| 969.1 | 0.192 |
| 969.15 | 0.191 |
| 969.2 | 0.188 |
| 969.25 | 0.185 |
| 969.3 | 0.182 |
| 969.35 | 0.179 |
| 969.4 | 0.177 |
| 969.45 | 0.174 |
| 969.5 | 0.172 |
| 969.55 | 0.171 |
| 969.6 | 0.168 |
| 969.65 | 0.166 |
| 969.7 | 0.164 |
| 969.75 | 0.163 |
| 969.8 | 0.163 |
| 969.85 | 0.162 |
| 969.9 | 0.16 |
| 969.95 | 0.16 |
| 970.0 | 0.16 |
| 970.05 | 0.159 |
| 970.1 | 0.159 |
| 970.15 | 0.158 |
| 970.2 | 0.157 |
| 970.25 | 0.156 |
| 970.3 | 0.155 |
| 970.35 | 0.154 |
| 970.4 | 0.153 |
| 970.45 | 0.152 |
| 970.5 | 0.151 |
| 970.55 | 0.15 |
| 970.6 | 0.15 |
| 970.65 | 0.148 |
| 970.7 | 0.147 |
| 970.75 | 0.147 |
| 970.8 | 0.146 |
| 970.85 | 0.145 |
| 970.9 | 0.143 |
| 970.95 | 0.143 |
| 971.0 | 0.142 |
| 971.05 | 0.139 |
| 971.1 | 0.137 |
| 971.15 | 0.136 |
| 971.2 | 0.134 |
| 971.25 | 0.134 |
| 971.3 | 0.133 |
| 971.35 | 0.133 |
| 971.4 | 0.131 |
| 971.45 | 0.13 |
| 971.5 | 0.129 |
| 971.55 | 0.128 |
| 971.6 | 0.128 |
| 971.65 | 0.126 |
| 971.7 | 0.125 |
| 971.75 | 0.125 |
| 971.8 | 0.125 |
| 971.85 | 0.123 |
| 971.9 | 0.121 |
| 971.95 | 0.121 |
| 972.0 | 0.12 |
| 972.05 | 0.119 |
| 972.1 | 0.119 |
| 972.15 | 0.118 |
| 972.2 | 0.119 |
| 972.25 | 0.12 |
| 972.3 | 0.12 |
| 972.35 | 0.119 |
| 972.4 | 0.121 |
| 972.45 | 0.122 |
| 972.5 | 0.122 |
| 972.55 | 0.123 |
| 972.6 | 0.124 |
| 972.65 | 0.125 |
| 972.7 | 0.128 |
| 972.75 | 0.128 |
| 972.8 | 0.128 |
| 972.85 | 0.129 |
| 972.9 | 0.131 |
| 972.95 | 0.132 |
| 973.0 | 0.132 |
| 973.05 | 0.134 |
| 973.1 | 0.135 |
| 973.15 | 0.135 |
| 973.2 | 0.137 |
| 973.25 | 0.137 |
| 973.3 | 0.14 |
| 973.35 | 0.142 |
| 973.4 | 0.145 |
| 973.45 | 0.148 |
| 973.5 | 0.15 |
| 973.55 | 0.153 |
| 973.6 | 0.155 |
| 973.65 | 0.159 |
| 973.7 | 0.163 |
| 973.75 | 0.166 |
| 973.8 | 0.169 |
| 973.85 | 0.17 |
| 973.9 | 0.174 |
| 973.95 | 0.177 |
| 974.0 | 0.18 |
| 974.05 | 0.182 |
| 974.1 | 0.185 |
| 974.15 | 0.189 |
| 974.2 | 0.193 |
| 974.25 | 0.197 |
| 974.3 | 0.201 |
| 974.35 | 0.205 |
| 974.4 | 0.21 |
| 974.45 | 0.214 |
| 974.5 | 0.218 |
| 974.55 | 0.222 |
| 974.6 | 0.228 |
| 974.65 | 0.236 |
| 974.7 | 0.243 |
| 974.75 | 0.249 |
| 974.8 | 0.257 |
| 974.85 | 0.264 |
| 974.9 | 0.272 |
| 974.95 | 0.281 |
| 975.0 | 0.292 |
| 975.05 | 0.306 |
| 975.1 | 0.32 |
| 975.15 | 0.334 |
| 975.2 | 0.348 |
| 975.25 | 0.364 |
| 975.3 | 0.383 |
| 975.35 | 0.404 |
| 975.4 | 0.424 |
| 975.45 | 0.449 |
| 975.5 | 0.48 |
| 975.55 | 0.512 |
| 975.6 | 0.546 |
| 975.65 | 0.585 |
| 975.7 | 0.626 |
| 975.75 | 0.667 |
| 975.8 | 0.711 |
| 975.85 | 0.758 |
| 975.9 | 0.817 |
| 975.95 | 0.885 |
| 976.0 | 0.954 |
| 976.05 | 1.019 |
| 976.1 | 1.09 |
| 976.15 | 1.161 |
| 976.2 | 1.233 |
| 976.25 | 1.308 |
| 976.3 | 1.395 |
| 976.35 | 1.485 |
| 976.4 | 1.579 |
| 976.45 | 1.664 |
| 976.5 | 1.75 |
| 976.55 | 1.837 |
| 976.6 | 1.932 |
| 976.65 | 2.025 |
| 976.7 | 2.123 |
| 976.75 | 2.236 |
| 976.8 | 2.36 |
| 976.85 | 2.483 |
| 976.9 | 2.609 |
| 976.95 | 2.734 |
| 977.0 | 2.858 |
| 977.05 | 2.983 |
| 977.1 | 3.104 |
| 977.15 | 3.218 |
| 977.2 | 3.335 |
| 977.25 | 3.437 |
| 977.3 | 3.511 |
| 977.35 | 3.555 |
| 977.4 | 3.576 |
| 977.45 | 3.576 |
| 977.5 | 3.559 |
| 977.55 | 3.519 |
| 977.6 | 3.464 |
| 977.65 | 3.382 |
| 977.7 | 3.267 |
| 977.75 | 3.135 |
| 977.8 | 3.001 |
| 977.85 | 2.859 |
| 977.9 | 2.712 |
| 977.95 | 2.575 |
| 978.0 | 2.433 |
| 978.05 | 2.293 |
| 978.1 | 2.137 |
| 978.15 | 1.982 |
| 978.2 | 1.837 |
| 978.25 | 1.714 |
| 978.3 | 1.594 |
| 978.35 | 1.482 |
| 978.4 | 1.376 |
| 978.45 | 1.278 |
| 978.5 | 1.179 |
| 978.55 | 1.086 |
| 978.6 | 0.999 |
| 978.65 | 0.933 |
| 978.7 | 0.872 |
| 978.75 | 0.816 |
| 978.8 | 0.763 |
| 978.85 | 0.715 |
| 978.9 | 0.672 |
| 978.95 | 0.629 |
| 979.0 | 0.588 |
| 979.05 | 0.552 |
| 979.1 | 0.519 |
| 979.15 | 0.488 |
| 979.2 | 0.461 |
| 979.25 | 0.437 |
| 979.3 | 0.414 |
| 979.35 | 0.392 |
| 979.4 | 0.37 |
| 979.45 | 0.348 |
| 979.5 | 0.329 |
| 979.55 | 0.315 |
| 979.6 | 0.301 |
| 979.65 | 0.289 |
| 979.7 | 0.276 |
| 979.75 | 0.264 |
| 979.8 | 0.253 |
| 979.85 | 0.243 |
| 979.9 | 0.232 |
| 979.95 | 0.226 |
| 980.0 | 0.219 |
| 980.05 | 0.212 |
| 980.1 | 0.204 |
| 980.15 | 0.198 |
| 980.2 | 0.192 |
| 980.25 | 0.187 |
| 980.3 | 0.181 |
| 980.35 | 0.177 |
| 980.4 | 0.171 |
| 980.45 | 0.168 |
| 980.5 | 0.162 |
| 980.55 | 0.158 |
| 980.6 | 0.155 |
| 980.65 | 0.152 |
| 980.7 | 0.148 |
| 980.75 | 0.145 |
| 980.8 | 0.142 |
| 980.85 | 0.14 |
| 980.9 | 0.137 |
| 980.95 | 0.134 |
| 981.0 | 0.132 |
| 981.05 | 0.131 |
| 981.1 | 0.129 |
| 981.15 | 0.127 |
| 981.2 | 0.125 |
| 981.25 | 0.123 |
| 981.3 | 0.122 |
| 981.35 | 0.12 |
| 981.4 | 0.118 |
| 981.45 | 0.117 |
| 981.5 | 0.116 |
| 981.55 | 0.113 |
| 981.6 | 0.111 |
| 981.65 | 0.109 |
| 981.7 | 0.108 |
| 981.75 | 0.107 |
| 981.8 | 0.105 |
| 981.85 | 0.104 |
| 981.9 | 0.102 |
| 981.95 | 0.102 |
| 982.0 | 0.101 |
| 982.05 | 0.101 |
| 982.1 | 0.101 |
| 982.15 | 0.1 |
| 982.2 | 0.099 |
| 982.25 | 0.098 |
| 982.3 | 0.097 |
| 982.35 | 0.096 |
| 982.4 | 0.096 |
| 982.45 | 0.095 |
| 982.5 | 0.094 |
| 982.55 | 0.093 |
| 982.6 | 0.093 |
| 982.65 | 0.093 |
| 982.7 | 0.093 |
| 982.75 | 0.093 |
| 982.8 | 0.094 |
| 982.85 | 0.094 |
| 982.9 | 0.094 |
| 982.95 | 0.093 |
| 983.0 | 0.093 |
| 983.05 | 0.094 |
| 983.1 | 0.094 |
| 983.15 | 0.093 |
| 983.2 | 0.093 |
| 983.25 | 0.093 |
| 983.3 | 0.092 |
| 983.35 | 0.092 |
| 983.4 | 0.093 |
| 983.45 | 0.094 |
| 983.5 | 0.093 |
| 983.55 | 0.093 |
| 983.6 | 0.093 |
| 983.65 | 0.092 |
| 983.7 | 0.092 |
| 983.75 | 0.093 |
| 983.8 | 0.094 |
| 983.85 | 0.095 |
| 983.9 | 0.095 |
| 983.95 | 0.094 |
| 984.0 | 0.094 |
| 984.05 | 0.095 |
| 984.1 | 0.096 |
| 984.15 | 0.096 |
| 984.2 | 0.096 |
| 984.25 | 0.095 |
| 984.3 | 0.096 |
| 984.35 | 0.096 |
| 984.4 | 0.096 |
| 984.45 | 0.096 |
| 984.5 | 0.095 |
| 984.55 | 0.096 |
| 984.6 | 0.095 |
| 984.65 | 0.095 |
| 984.7 | 0.096 |
| 984.75 | 0.096 |
| 984.8 | 0.096 |
| 984.85 | 0.095 |
| 984.9 | 0.095 |
| 984.95 | 0.094 |
| 985.0 | 0.094 |
| 985.05 | 0.094 |
| 985.1 | 0.093 |
| 985.15 | 0.094 |
| 985.2 | 0.094 |
| 985.25 | 0.094 |
| 985.3 | 0.093 |
| 985.35 | 0.093 |
| 985.4 | 0.093 |
| 985.45 | 0.093 |
| 985.5 | 0.092 |
| 985.55 | 0.093 |
| 985.6 | 0.092 |
| 985.65 | 0.092 |
| 985.7 | 0.092 |
| 985.75 | 0.091 |
| 985.8 | 0.091 |
| 985.85 | 0.091 |
| 985.9 | 0.091 |
| 985.95 | 0.091 |
| 986.0 | 0.091 |
| 986.05 | 0.091 |
| 986.1 | 0.091 |
| 986.15 | 0.091 |
| 986.2 | 0.091 |
| 986.25 | 0.09 |
| 986.3 | 0.09 |
| 986.35 | 0.09 |
| 986.4 | 0.091 |
| 986.45 | 0.091 |
| 986.5 | 0.091 |
| 986.55 | 0.092 |
| 986.6 | 0.092 |
| 986.65 | 0.092 |
| 986.7 | 0.092 |
| 986.75 | 0.092 |
| 986.8 | 0.093 |
| 986.85 | 0.094 |
| 986.9 | 0.094 |
| 986.95 | 0.093 |
| 987.0 | 0.093 |
| 987.05 | 0.092 |
| 987.1 | 0.092 |
| 987.15 | 0.091 |
| 987.2 | 0.091 |
| 987.25 | 0.091 |
| 987.3 | 0.092 |
| 987.35 | 0.092 |
| 987.4 | 0.092 |
| 987.45 | 0.092 |
| 987.5 | 0.092 |
| 987.55 | 0.092 |
| 987.6 | 0.092 |
| 987.65 | 0.093 |
| 987.7 | 0.094 |
| 987.75 | 0.094 |
| 987.8 | 0.093 |
| 987.85 | 0.091 |
| 987.9 | 0.092 |
| 987.95 | 0.092 |
| 988.0 | 0.091 |
| 988.05 | 0.092 |
| 988.1 | 0.091 |
| 988.15 | 0.091 |
| 988.2 | 0.09 |
| 988.25 | 0.09 |
| 988.3 | 0.09 |
| 988.35 | 0.09 |
| 988.4 | 0.091 |
| 988.45 | 0.09 |
| 988.5 | 0.089 |
| 988.55 | 0.088 |
| 988.6 | 0.087 |
| 988.65 | 0.086 |
| 988.7 | 0.086 |
| 988.75 | 0.086 |
| 988.8 | 0.085 |
| 988.85 | 0.085 |
| 988.9 | 0.084 |
| 988.95 | 0.084 |
| 989.0 | 0.084 |
| 989.05 | 0.085 |
| 989.1 | 0.084 |
| 989.15 | 0.084 |
| 989.2 | 0.083 |
| 989.25 | 0.083 |
| 989.3 | 0.082 |
| 989.35 | 0.082 |
| 989.4 | 0.082 |
| 989.45 | 0.081 |
| 989.5 | 0.079 |
| 989.55 | 0.079 |
| 989.6 | 0.076 |
| 989.65 | 0.076 |
| 989.7 | 0.076 |
| 989.75 | 0.076 |
| 989.8 | 0.075 |
| 989.85 | 0.076 |
| 989.9 | 0.074 |
| 989.95 | 0.074 |
| 990.0 | 0.073 |
| 990.05 | 0.074 |
| 990.1 | 0.073 |
| 990.15 | 0.073 |
| 990.2 | 0.073 |
| 990.25 | 0.071 |
| 990.3 | 0.07 |
| 990.35 | 0.068 |
| 990.4 | 0.067 |
| 990.45 | 0.067 |
| 990.5 | 0.067 |
| 990.55 | 0.066 |
| 990.6 | 0.065 |
| 990.65 | 0.065 |
| 990.7 | 0.063 |
| 990.75 | 0.063 |
| 990.8 | 0.063 |
| 990.85 | 0.063 |
| 990.9 | 0.062 |
| 990.95 | 0.062 |
| 991.0 | 0.061 |
| 991.05 | 0.059 |
| 991.1 | 0.059 |
| 991.15 | 0.059 |
| 991.2 | 0.057 |
| 991.25 | 0.058 |
| 991.3 | 0.056 |
| 991.35 | 0.056 |
| 991.4 | 0.056 |
| 991.45 | 0.057 |
| 991.5 | 0.056 |
| 991.55 | 0.055 |
| 991.6 | 0.056 |
| 991.65 | 0.055 |
| 991.7 | 0.055 |
| 991.75 | 0.054 |
| 991.8 | 0.053 |
| 991.85 | 0.053 |
| 991.9 | 0.052 |
| 991.95 | 0.052 |
| 992.0 | 0.051 |
| 992.05 | 0.05 |
| 992.1 | 0.05 |
| 992.15 | 0.051 |
| 992.2 | 0.05 |
| 992.25 | 0.05 |
| 992.3 | 0.051 |
| 992.35 | 0.052 |
| 992.4 | 0.052 |
| 992.45 | 0.052 |
| 992.5 | 0.052 |
| 992.55 | 0.052 |
| 992.6 | 0.052 |
| 992.65 | 0.052 |
| 992.7 | 0.051 |
| 992.75 | 0.051 |
| 992.8 | 0.051 |
| 992.85 | 0.05 |
| 992.9 | 0.049 |
| 992.95 | 0.049 |
| 993.0 | 0.048 |
| 993.05 | 0.049 |
| 993.1 | 0.05 |
| 993.15 | 0.05 |
| 993.2 | 0.051 |
| 993.25 | 0.051 |
| 993.3 | 0.051 |
| 993.35 | 0.051 |
| 993.4 | 0.051 |
| 993.45 | 0.051 |
| 993.5 | 0.052 |
| 993.55 | 0.053 |
| 993.6 | 0.053 |
| 993.65 | 0.052 |
| 993.7 | 0.052 |
| 993.75 | 0.051 |
| 993.8 | 0.051 |
| 993.85 | 0.051 |
| 993.9 | 0.051 |
| 993.95 | 0.052 |
| 994.0 | 0.052 |
| 994.05 | 0.052 |
| 994.1 | 0.051 |
| 994.15 | 0.051 |
| 994.2 | 0.05 |
| 994.25 | 0.049 |
| 994.3 | 0.049 |
| 994.35 | 0.048 |
| 994.4 | 0.047 |
| 994.45 | 0.047 |
| 994.5 | 0.045 |
| 994.55 | 0.045 |
| 994.6 | 0.044 |
| 994.65 | 0.044 |
| 994.7 | 0.044 |
| 994.75 | 0.044 |
| 994.8 | 0.044 |
| 994.85 | 0.045 |
| 994.9 | 0.045 |
| 994.95 | 0.044 |
| 995.0 | 0.045 |
| 995.05 | 0.043 |
| 995.1 | 0.043 |
| 995.15 | 0.042 |
| 995.2 | 0.04 |
| 995.25 | 0.039 |
| 995.3 | 0.038 |
| 995.35 | 0.037 |
| 995.4 | 0.036 |
| 995.45 | 0.035 |
| 995.5 | 0.034 |
| 995.55 | 0.033 |
| 995.6 | 0.034 |
| 995.65 | 0.034 |
| 995.7 | 0.036 |
| 995.75 | 0.036 |
| 995.8 | 0.036 |
| 995.85 | 0.036 |
| 995.9 | 0.036 |
| 995.95 | 0.037 |
| 996.0 | 0.037 |
| 996.05 | 0.036 |
| 996.1 | 0.036 |
| 996.15 | 0.035 |
| 996.2 | 0.035 |
| 996.25 | 0.034 |
| 996.3 | 0.034 |
| 996.35 | 0.035 |
| 996.4 | 0.035 |
| 996.45 | 0.035 |
| 996.5 | 0.035 |
| 996.55 | 0.035 |
| 996.6 | 0.036 |
| 996.65 | 0.036 |
| 996.7 | 0.037 |
| 996.75 | 0.036 |
| 996.8 | 0.036 |
| 996.85 | 0.035 |
| 996.9 | 0.034 |
| 996.95 | 0.033 |
| 997.0 | 0.032 |
| 997.05 | 0.031 |
| 997.1 | 0.032 |
| 997.15 | 0.031 |
| 997.2 | 0.031 |
| 997.25 | 0.029 |
| 997.3 | 0.031 |
| 997.35 | 0.03 |
| 997.4 | 0.029 |
| 997.45 | 0.03 |
| 997.5 | 0.03 |
| 997.55 | 0.031 |
| 997.6 | 0.031 |
| 997.65 | 0.031 |
| 997.7 | 0.03 |
| 997.75 | 0.029 |
| 997.8 | 0.03 |
| 997.85 | 0.029 |
| 997.9 | 0.029 |
| 997.95 | 0.03 |
| 998.0 | 0.029 |
| 998.05 | 0.029 |
| 998.1 | 0.027 |
| 998.15 | 0.026 |
| 998.2 | 0.027 |
| 998.25 | 0.027 |
| 998.3 | 0.027 |
| 998.35 | 0.027 |
| 998.4 | 0.027 |
| 998.45 | 0.026 |
| 998.5 | 0.025 |
| 998.55 | 0.027 |
| 998.6 | 0.026 |
| 998.65 | 0.027 |
| 998.7 | 0.027 |
| 998.75 | 0.026 |
| 998.8 | 0.026 |
| 998.85 | 0.026 |
| 998.9 | 0.027 |
| 998.95 | 0.026 |
| 999.0 | 0.027 |
| 999.05 | 0.027 |
| 999.1 | 0.026 |
| 999.15 | 0.025 |
| 999.2 | 0.026 |
| 999.25 | 0.026 |
| 999.3 | 0.026 |
| 999.35 | 0.027 |
| 999.4 | 0.026 |
| 999.45 | 0.026 |
| 999.5 | 0.026 |
| 999.55 | 0.025 |
| 999.6 | 0.026 |
| 999.65 | 0.026 |
| 999.7 | 0.026 |
| 999.75 | 0.027 |
| 999.8 | 0.027 |
| 999.85 | 0.027 |
| 999.9 | 0.027 |
| 999.95 | 0.026 |
| 1000.0 | 0.026 |
| 1000.05 | 0.026 |
| 1000.1 | 0.026 |
| 1000.15 | 0.025 |
| 1000.2 | 0.024 |
| 1000.25 | 0.025 |
| 1000.3 | 0.024 |
| 1000.35 | 0.024 |
| 1000.4 | 0.024 |
| 1000.45 | 0.024 |
| 1000.5 | 0.024 |
| 1000.55 | 0.023 |
| 1000.6 | 0.024 |
| 1000.65 | 0.024 |
| 1000.7 | 0.025 |
| 1000.75 | 0.025 |
| 1000.8 | 0.024 |
| 1000.85 | 0.024 |
| 1000.9 | 0.023 |
| 1000.95 | 0.023 |
| 1001.0 | 0.022 |
| 1001.05 | 0.022 |
| 1001.1 | 0.023 |
| 1001.15 | 0.022 |
| 1001.2 | 0.023 |
| 1001.25 | 0.022 |
| 1001.3 | 0.023 |
| 1001.35 | 0.023 |
| 1001.4 | 0.022 |
| 1001.45 | 0.022 |
| 1001.5 | 0.022 |
| 1001.55 | 0.022 |
| 1001.6 | 0.022 |
| 1001.65 | 0.023 |
| 1001.7 | 0.023 |
| 1001.75 | 0.023 |
| 1001.8 | 0.024 |
| 1001.85 | 0.023 |
| 1001.9 | 0.022 |
| 1001.95 | 0.023 |
| 1002.0 | 0.024 |
| 1002.05 | 0.023 |
| 1002.1 | 0.023 |
| 1002.15 | 0.023 |
| 1002.2 | 0.023 |
| 1002.25 | 0.023 |
| 1002.3 | 0.023 |
| 1002.35 | 0.023 |
| 1002.4 | 0.024 |
| 1002.45 | 0.026 |
| 1002.5 | 0.027 |
| 1002.55 | 0.026 |
| 1002.6 | 0.026 |
| 1002.65 | 0.028 |
| 1002.7 | 0.029 |
| 1002.75 | 0.03 |
| 1002.8 | 0.03 |
| 1002.85 | 0.03 |
| 1002.9 | 0.03 |
| 1002.95 | 0.03 |
| 1003.0 | 0.029 |
| 1003.05 | 0.029 |
| 1003.1 | 0.029 |
| 1003.15 | 0.031 |
| 1003.2 | 0.03 |
| 1003.25 | 0.03 |
| 1003.3 | 0.03 |
| 1003.35 | 0.03 |
| 1003.4 | 0.03 |
| 1003.45 | 0.029 |
| 1003.5 | 0.029 |
| 1003.55 | 0.029 |
| 1003.6 | 0.028 |
| 1003.65 | 0.029 |
| 1003.7 | 0.03 |
| 1003.75 | 0.03 |
| 1003.8 | 0.03 |
| 1003.85 | 0.03 |
| 1003.9 | 0.03 |
| 1003.95 | 0.03 |
| 1004.0 | 0.032 |
| 1004.05 | 0.033 |
| 1004.1 | 0.034 |
| 1004.15 | 0.035 |
| 1004.2 | 0.034 |
| 1004.25 | 0.034 |
| 1004.3 | 0.034 |
| 1004.35 | 0.033 |
| 1004.4 | 0.034 |
| 1004.45 | 0.036 |
| 1004.5 | 0.037 |
| 1004.55 | 0.036 |
| 1004.6 | 0.036 |
| 1004.65 | 0.037 |
| 1004.7 | 0.037 |
| 1004.75 | 0.038 |
| 1004.8 | 0.039 |
| 1004.85 | 0.04 |
| 1004.9 | 0.041 |
| 1004.95 | 0.041 |
| 1005.0 | 0.04 |
| 1005.05 | 0.039 |
| 1005.1 | 0.04 |
| 1005.15 | 0.04 |
| 1005.2 | 0.039 |
| 1005.25 | 0.039 |
| 1005.3 | 0.039 |
| 1005.35 | 0.039 |
| 1005.4 | 0.038 |
| 1005.45 | 0.038 |
| 1005.5 | 0.038 |
| 1005.55 | 0.04 |
| 1005.6 | 0.041 |
| 1005.65 | 0.04 |
| 1005.7 | 0.041 |
| 1005.75 | 0.042 |
| 1005.8 | 0.043 |
| 1005.85 | 0.043 |
| 1005.9 | 0.044 |
| 1005.95 | 0.045 |
| 1006.0 | 0.045 |
| 1006.05 | 0.046 |
| 1006.1 | 0.045 |
| 1006.15 | 0.045 |
| 1006.2 | 0.045 |
| 1006.25 | 0.044 |
| 1006.3 | 0.044 |
| 1006.35 | 0.044 |
| 1006.4 | 0.045 |
| 1006.45 | 0.044 |
| 1006.5 | 0.043 |
| 1006.55 | 0.043 |
| 1006.6 | 0.043 |
| 1006.65 | 0.042 |
| 1006.7 | 0.043 |
| 1006.75 | 0.042 |
| 1006.8 | 0.043 |
| 1006.85 | 0.042 |
| 1006.9 | 0.042 |
| 1006.95 | 0.042 |
| 1007.0 | 0.041 |
| 1007.05 | 0.041 |
| 1007.1 | 0.041 |
| 1007.15 | 0.041 |
| 1007.2 | 0.041 |
| 1007.25 | 0.042 |
| 1007.3 | 0.042 |
| 1007.35 | 0.04 |
| 1007.4 | 0.042 |
| 1007.45 | 0.042 |
| 1007.5 | 0.042 |
| 1007.55 | 0.043 |
| 1007.6 | 0.044 |
| 1007.65 | 0.045 |
| 1007.7 | 0.045 |
| 1007.75 | 0.045 |
| 1007.8 | 0.046 |
| 1007.85 | 0.045 |
| 1007.9 | 0.046 |
| 1007.95 | 0.045 |
| 1008.0 | 0.045 |
| 1008.05 | 0.046 |
| 1008.1 | 0.047 |
| 1008.15 | 0.047 |
| 1008.2 | 0.047 |
| 1008.25 | 0.047 |
| 1008.3 | 0.047 |
| 1008.35 | 0.046 |
| 1008.4 | 0.046 |
| 1008.45 | 0.048 |
| 1008.5 | 0.047 |
| 1008.55 | 0.047 |
| 1008.6 | 0.047 |
| 1008.65 | 0.044 |
| 1008.7 | 0.044 |
| 1008.75 | 0.043 |
| 1008.8 | 0.043 |
| 1008.85 | 0.043 |
| 1008.9 | 0.045 |
| 1008.95 | 0.044 |
| 1009.0 | 0.044 |
| 1009.05 | 0.044 |
| 1009.1 | 0.044 |
| 1009.15 | 0.044 |
| 1009.2 | 0.045 |
| 1009.25 | 0.045 |
| 1009.3 | 0.045 |
| 1009.35 | 0.045 |
| 1009.4 | 0.046 |
| 1009.45 | 0.045 |
| 1009.5 | 0.045 |
| 1009.55 | 0.045 |
| 1009.6 | 0.044 |
| 1009.65 | 0.044 |
| 1009.7 | 0.045 |
| 1009.75 | 0.045 |
| 1009.8 | 0.046 |
| 1009.85 | 0.046 |
| 1009.9 | 0.046 |
| 1009.95 | 0.046 |
| 1010.0 | 0.045 |
| 1010.05 | 0.046 |
| 1010.1 | 0.047 |
| 1010.15 | 0.047 |
| 1010.2 | 0.048 |
| 1010.25 | 0.048 |
| 1010.3 | 0.047 |
| 1010.35 | 0.047 |
| 1010.4 | 0.048 |
| 1010.45 | 0.047 |
| 1010.5 | 0.048 |
| 1010.55 | 0.049 |
| 1010.6 | 0.049 |
| 1010.65 | 0.049 |
| 1010.7 | 0.049 |
| 1010.75 | 0.048 |
| 1010.8 | 0.047 |
| 1010.85 | 0.047 |
| 1010.9 | 0.046 |
| 1010.95 | 0.047 |
| 1011.0 | 0.047 |
| 1011.05 | 0.048 |
| 1011.1 | 0.047 |
| 1011.15 | 0.046 |
| 1011.2 | 0.046 |
| 1011.25 | 0.044 |
| 1011.3 | 0.044 |
| 1011.35 | 0.045 |
| 1011.4 | 0.045 |
| 1011.45 | 0.045 |
| 1011.5 | 0.044 |
| 1011.55 | 0.043 |
| 1011.6 | 0.043 |
| 1011.65 | 0.043 |
| 1011.7 | 0.042 |
| 1011.75 | 0.043 |
| 1011.8 | 0.043 |
| 1011.85 | 0.045 |
| 1011.9 | 0.043 |
| 1011.95 | 0.044 |
| 1012.0 | 0.045 |
| 1012.05 | 0.046 |
| 1012.1 | 0.045 |
| 1012.15 | 0.045 |
| 1012.2 | 0.045 |
| 1012.25 | 0.046 |
| 1012.3 | 0.045 |
| 1012.35 | 0.045 |
| 1012.4 | 0.044 |
| 1012.45 | 0.045 |
| 1012.5 | 0.044 |
| 1012.55 | 0.044 |
| 1012.6 | 0.044 |
| 1012.65 | 0.044 |
| 1012.7 | 0.045 |
| 1012.75 | 0.045 |
| 1012.8 | 0.044 |
| 1012.85 | 0.044 |
| 1012.9 | 0.045 |
| 1012.95 | 0.044 |
| 1013.0 | 0.045 |
| 1013.05 | 0.045 |
| 1013.1 | 0.045 |
| 1013.15 | 0.043 |
| 1013.2 | 0.044 |
| 1013.25 | 0.043 |
| 1013.3 | 0.043 |
| 1013.35 | 0.044 |
| 1013.4 | 0.044 |
| 1013.45 | 0.043 |
| 1013.5 | 0.044 |
| 1013.55 | 0.043 |
| 1013.6 | 0.043 |
| 1013.65 | 0.044 |
| 1013.7 | 0.044 |
| 1013.75 | 0.043 |
| 1013.8 | 0.042 |
| 1013.85 | 0.042 |
| 1013.9 | 0.042 |
| 1013.95 | 0.043 |
| 1014.0 | 0.044 |
| 1014.05 | 0.044 |
| 1014.1 | 0.044 |
| 1014.15 | 0.044 |
| 1014.2 | 0.043 |
| 1014.25 | 0.042 |
| 1014.3 | 0.043 |
| 1014.35 | 0.044 |
| 1014.4 | 0.044 |
| 1014.45 | 0.044 |
| 1014.5 | 0.043 |
| 1014.55 | 0.042 |
| 1014.6 | 0.041 |
| 1014.65 | 0.041 |
| 1014.7 | 0.041 |
| 1014.75 | 0.04 |
| 1014.8 | 0.041 |
| 1014.85 | 0.041 |
| 1014.9 | 0.04 |
| 1014.95 | 0.04 |
| 1015.0 | 0.039 |
| 1015.05 | 0.038 |
| 1015.1 | 0.039 |
| 1015.15 | 0.039 |
| 1015.2 | 0.04 |
| 1015.25 | 0.039 |
| 1015.3 | 0.039 |
| 1015.35 | 0.039 |
| 1015.4 | 0.039 |
| 1015.45 | 0.04 |
| 1015.5 | 0.04 |
| 1015.55 | 0.041 |
| 1015.6 | 0.041 |
| 1015.65 | 0.04 |
| 1015.7 | 0.04 |
| 1015.75 | 0.039 |
| 1015.8 | 0.04 |
| 1015.85 | 0.039 |
| 1015.9 | 0.037 |
| 1015.95 | 0.037 |
| 1016.0 | 0.035 |
| 1016.05 | 0.035 |
| 1016.1 | 0.035 |
| 1016.15 | 0.035 |
| 1016.2 | 0.035 |
| 1016.25 | 0.035 |
| 1016.3 | 0.035 |
| 1016.35 | 0.035 |
| 1016.4 | 0.036 |
| 1016.45 | 0.037 |
| 1016.5 | 0.038 |
| 1016.55 | 0.039 |
| 1016.6 | 0.038 |
| 1016.65 | 0.037 |
| 1016.7 | 0.037 |
| 1016.75 | 0.037 |
| 1016.8 | 0.036 |
| 1016.85 | 0.036 |
| 1016.9 | 0.034 |
| 1016.95 | 0.033 |
| 1017.0 | 0.033 |
| 1017.05 | 0.033 |
| 1017.1 | 0.033 |
| 1017.15 | 0.033 |
| 1017.2 | 0.034 |
| 1017.25 | 0.033 |
| 1017.3 | 0.033 |
| 1017.35 | 0.034 |
| 1017.4 | 0.034 |
| 1017.45 | 0.035 |
| 1017.5 | 0.035 |
| 1017.55 | 0.035 |
| 1017.6 | 0.035 |
| 1017.65 | 0.035 |
| 1017.7 | 0.034 |
| 1017.75 | 0.034 |
| 1017.8 | 0.036 |
| 1017.85 | 0.035 |
| 1017.9 | 0.034 |
| 1017.95 | 0.033 |
| 1018.0 | 0.033 |
| 1018.05 | 0.033 |
| 1018.1 | 0.032 |
| 1018.15 | 0.033 |
| 1018.2 | 0.032 |
| 1018.25 | 0.032 |
| 1018.3 | 0.031 |
| 1018.35 | 0.029 |
| 1018.4 | 0.029 |
| 1018.45 | 0.029 |
| 1018.5 | 0.029 |
| 1018.55 | 0.029 |
| 1018.6 | 0.029 |
| 1018.65 | 0.03 |
| 1018.7 | 0.03 |
| 1018.75 | 0.029 |
| 1018.8 | 0.028 |
| 1018.85 | 0.028 |
| 1018.9 | 0.029 |
| 1018.95 | 0.029 |
| 1019.0 | 0.029 |
| 1019.05 | 0.028 |
| 1019.1 | 0.028 |
| 1019.15 | 0.028 |
| 1019.2 | 0.026 |
| 1019.25 | 0.025 |
| 1019.3 | 0.025 |
| 1019.35 | 0.026 |
| 1019.4 | 0.026 |
| 1019.45 | 0.026 |
| 1019.5 | 0.026 |
| 1019.55 | 0.026 |
| 1019.6 | 0.026 |
| 1019.65 | 0.026 |
| 1019.7 | 0.025 |
| 1019.75 | 0.025 |
| 1019.8 | 0.025 |
| 1019.85 | 0.024 |
| 1019.9 | 0.024 |
| 1019.95 | 0.023 |
| 1020.0 | 0.023 |
| 1020.05 | 0.023 |
| 1020.1 | 0.022 |
| 1020.15 | 0.022 |
| 1020.2 | 0.022 |
| 1020.25 | 0.023 |
| 1020.3 | 0.023 |
| 1020.35 | 0.022 |
| 1020.4 | 0.023 |
| 1020.45 | 0.023 |
| 1020.5 | 0.022 |
| 1020.55 | 0.022 |
| 1020.6 | 0.022 |
| 1020.65 | 0.022 |
| 1020.7 | 0.021 |
| 1020.75 | 0.022 |
| 1020.8 | 0.022 |
| 1020.85 | 0.022 |
| 1020.9 | 0.022 |
| 1020.95 | 0.022 |
| 1021.0 | 0.023 |
| 1021.05 | 0.024 |
| 1021.1 | 0.023 |
| 1021.15 | 0.023 |
| 1021.2 | 0.023 |
| 1021.25 | 0.024 |
| 1021.3 | 0.022 |
| 1021.35 | 0.022 |
| 1021.4 | 0.022 |
| 1021.45 | 0.022 |
| 1021.5 | 0.023 |
| 1021.55 | 0.022 |
| 1021.6 | 0.022 |
| 1021.65 | 0.023 |
| 1021.7 | 0.024 |
| 1021.75 | 0.024 |
| 1021.8 | 0.025 |
| 1021.85 | 0.025 |
| 1021.9 | 0.025 |
| 1021.95 | 0.025 |
| 1022.0 | 0.025 |
| 1022.05 | 0.026 |
| 1022.1 | 0.025 |
| 1022.15 | 0.025 |
| 1022.2 | 0.025 |
| 1022.25 | 0.025 |
| 1022.3 | 0.026 |
| 1022.35 | 0.025 |
| 1022.4 | 0.025 |
| 1022.45 | 0.026 |
| 1022.5 | 0.026 |
| 1022.55 | 0.026 |
| 1022.6 | 0.025 |
| 1022.65 | 0.025 |
| 1022.7 | 0.027 |
| 1022.75 | 0.027 |
| 1022.8 | 0.026 |
| 1022.85 | 0.027 |
| 1022.9 | 0.027 |
| 1022.95 | 0.027 |
| 1023.0 | 0.026 |
| 1023.05 | 0.026 |
| 1023.1 | 0.025 |
| 1023.15 | 0.025 |
| 1023.2 | 0.025 |
| 1023.25 | 0.024 |
| 1023.3 | 0.024 |
| 1023.35 | 0.024 |
| 1023.4 | 0.023 |
| 1023.45 | 0.023 |
| 1023.5 | 0.023 |
| 1023.55 | 0.025 |
| 1023.6 | 0.025 |
| 1023.65 | 0.026 |
| 1023.7 | 0.027 |
| 1023.75 | 0.026 |
| 1023.8 | 0.026 |
| 1023.85 | 0.026 |
| 1023.9 | 0.027 |
| 1023.95 | 0.025 |
| 1024.0 | 0.026 |
| 1024.05 | 0.026 |
| 1024.1 | 0.025 |
| 1024.15 | 0.024 |
| 1024.2 | 0.024 |
| 1024.25 | 0.024 |
| 1024.3 | 0.024 |
| 1024.35 | 0.023 |
| 1024.4 | 0.023 |
| 1024.45 | 0.023 |
| 1024.5 | 0.024 |
| 1024.55 | 0.024 |
| 1024.6 | 0.025 |
| 1024.65 | 0.024 |
| 1024.7 | 0.024 |
| 1024.75 | 0.024 |
| 1024.8 | 0.024 |
| 1024.85 | 0.023 |
| 1024.9 | 0.025 |
| 1024.95 | 0.024 |
| 1025.0 | 0.025 |
| 1025.05 | 0.024 |
| 1025.1 | 0.024 |
| 1025.15 | 0.023 |
| 1025.2 | 0.023 |
| 1025.25 | 0.023 |
| 1025.3 | 0.023 |
| 1025.35 | 0.022 |
| 1025.4 | 0.022 |
| 1025.45 | 0.022 |
| 1025.5 | 0.022 |
| 1025.55 | 0.022 |
| 1025.6 | 0.022 |
| 1025.65 | 0.022 |
| 1025.7 | 0.021 |
| 1025.75 | 0.022 |
| 1025.8 | 0.022 |
| 1025.85 | 0.022 |
| 1025.9 | 0.024 |
| 1025.95 | 0.025 |
| 1026.0 | 0.024 |
| 1026.05 | 0.025 |
| 1026.1 | 0.025 |
| 1026.15 | 0.026 |
| 1026.2 | 0.025 |
| 1026.25 | 0.026 |
| 1026.3 | 0.026 |
| 1026.35 | 0.026 |
| 1026.4 | 0.026 |
| 1026.45 | 0.025 |
| 1026.5 | 0.025 |
| 1026.55 | 0.026 |
| 1026.6 | 0.025 |
| 1026.65 | 0.024 |
| 1026.7 | 0.025 |
| 1026.75 | 0.026 |
| 1026.8 | 0.027 |
| 1026.85 | 0.026 |
| 1026.9 | 0.026 |
| 1026.95 | 0.027 |
| 1027.0 | 0.027 |
| 1027.05 | 0.028 |
| 1027.1 | 0.029 |
| 1027.15 | 0.028 |
| 1027.2 | 0.028 |
| 1027.25 | 0.028 |
| 1027.3 | 0.028 |
| 1027.35 | 0.027 |
| 1027.4 | 0.027 |
| 1027.45 | 0.027 |
| 1027.5 | 0.028 |
| 1027.55 | 0.028 |
| 1027.6 | 0.028 |
| 1027.65 | 0.028 |
| 1027.7 | 0.028 |
| 1027.75 | 0.028 |
| 1027.8 | 0.027 |
| 1027.85 | 0.026 |
| 1027.9 | 0.028 |
| 1027.95 | 0.028 |
| 1028.0 | 0.028 |
| 1028.05 | 0.028 |
| 1028.1 | 0.028 |
| 1028.15 | 0.028 |
| 1028.2 | 0.029 |
| 1028.25 | 0.028 |
| 1028.3 | 0.029 |
| 1028.35 | 0.031 |
| 1028.4 | 0.032 |
| 1028.45 | 0.032 |
| 1028.5 | 0.034 |
| 1028.55 | 0.034 |
| 1028.6 | 0.033 |
| 1028.65 | 0.034 |
| 1028.7 | 0.033 |
| 1028.75 | 0.033 |
| 1028.8 | 0.034 |
| 1028.85 | 0.033 |
| 1028.9 | 0.033 |
| 1028.95 | 0.032 |
| 1029.0 | 0.031 |
| 1029.05 | 0.031 |
| 1029.1 | 0.03 |
| 1029.15 | 0.03 |
| 1029.2 | 0.03 |
| 1029.25 | 0.03 |
| 1029.3 | 0.03 |
| 1029.35 | 0.03 |
| 1029.4 | 0.03 |
| 1029.45 | 0.03 |
| 1029.5 | 0.03 |
| 1029.55 | 0.031 |
| 1029.6 | 0.031 |
| 1029.65 | 0.031 |
| 1029.7 | 0.031 |
| 1029.75 | 0.032 |
| 1029.8 | 0.032 |
| 1029.85 | 0.031 |
| 1029.9 | 0.03 |
| 1029.95 | 0.029 |
| 1030.0 | 0.03 |
| 1030.05 | 0.029 |
| 1030.1 | 0.029 |
| 1030.15 | 0.029 |
| 1030.2 | 0.029 |
| 1030.25 | 0.03 |
| 1030.3 | 0.03 |
| 1030.35 | 0.031 |
| 1030.4 | 0.031 |
| 1030.45 | 0.031 |
| 1030.5 | 0.031 |
| 1030.55 | 0.03 |
| 1030.6 | 0.032 |
| 1030.65 | 0.032 |
| 1030.7 | 0.032 |
| 1030.75 | 0.032 |
| 1030.8 | 0.032 |
| 1030.85 | 0.032 |
| 1030.9 | 0.032 |
| 1030.95 | 0.033 |
| 1031.0 | 0.034 |
| 1031.05 | 0.035 |
| 1031.1 | 0.036 |
| 1031.15 | 0.035 |
| 1031.2 | 0.035 |
| 1031.25 | 0.035 |
| 1031.3 | 0.036 |
| 1031.35 | 0.035 |
| 1031.4 | 0.034 |
| 1031.45 | 0.034 |
| 1031.5 | 0.034 |
| 1031.55 | 0.034 |
| 1031.6 | 0.033 |
| 1031.65 | 0.033 |
| 1031.7 | 0.033 |
| 1031.75 | 0.033 |
| 1031.8 | 0.033 |
| 1031.85 | 0.033 |
| 1031.9 | 0.033 |
| 1031.95 | 0.034 |
| 1032.0 | 0.034 |
| 1032.05 | 0.033 |
| 1032.1 | 0.034 |
| 1032.15 | 0.035 |
| 1032.2 | 0.035 |
| 1032.25 | 0.035 |
| 1032.3 | 0.035 |
| 1032.35 | 0.035 |
| 1032.4 | 0.037 |
| 1032.45 | 0.035 |
| 1032.5 | 0.035 |
| 1032.55 | 0.036 |
| 1032.6 | 0.037 |
| 1032.65 | 0.038 |
| 1032.7 | 0.037 |
| 1032.75 | 0.037 |
| 1032.8 | 0.039 |
| 1032.85 | 0.039 |
| 1032.9 | 0.04 |
| 1032.95 | 0.039 |
| 1033.0 | 0.041 |
| 1033.05 | 0.041 |
| 1033.1 | 0.042 |
| 1033.15 | 0.042 |
| 1033.2 | 0.042 |
| 1033.25 | 0.043 |
| 1033.3 | 0.043 |
| 1033.35 | 0.044 |
| 1033.4 | 0.044 |
| 1033.45 | 0.045 |
| 1033.5 | 0.046 |
| 1033.55 | 0.046 |
| 1033.6 | 0.046 |
| 1033.65 | 0.047 |
| 1033.7 | 0.047 |
| 1033.75 | 0.047 |
| 1033.8 | 0.047 |
| 1033.85 | 0.047 |
| 1033.9 | 0.047 |
| 1033.95 | 0.047 |
| 1034.0 | 0.046 |
| 1034.05 | 0.047 |
| 1034.1 | 0.046 |
| 1034.15 | 0.046 |
| 1034.2 | 0.046 |
| 1034.25 | 0.047 |
| 1034.3 | 0.047 |
| 1034.35 | 0.047 |
| 1034.4 | 0.045 |
| 1034.45 | 0.045 |
| 1034.5 | 0.045 |
| 1034.55 | 0.046 |
| 1034.6 | 0.046 |
| 1034.65 | 0.046 |
| 1034.7 | 0.046 |
| 1034.75 | 0.046 |
| 1034.8 | 0.045 |
| 1034.85 | 0.044 |
| 1034.9 | 0.046 |
| 1034.95 | 0.047 |
| 1035.0 | 0.048 |
| 1035.05 | 0.048 |
| 1035.1 | 0.048 |
| 1035.15 | 0.047 |
| 1035.2 | 0.047 |
| 1035.25 | 0.046 |
| 1035.3 | 0.046 |
| 1035.35 | 0.046 |
| 1035.4 | 0.047 |
| 1035.45 | 0.045 |
| 1035.5 | 0.044 |
| 1035.55 | 0.044 |
| 1035.6 | 0.042 |
| 1035.65 | 0.042 |
| 1035.7 | 0.041 |
| 1035.75 | 0.042 |
| 1035.8 | 0.042 |
| 1035.85 | 0.041 |
| 1035.9 | 0.042 |
| 1035.95 | 0.042 |
| 1036.0 | 0.042 |
| 1036.05 | 0.042 |
| 1036.1 | 0.042 |
| 1036.15 | 0.043 |
| 1036.2 | 0.043 |
| 1036.25 | 0.043 |
| 1036.3 | 0.043 |
| 1036.35 | 0.043 |
| 1036.4 | 0.044 |
| 1036.45 | 0.043 |
| 1036.5 | 0.043 |
| 1036.55 | 0.042 |
| 1036.6 | 0.042 |
| 1036.65 | 0.042 |
| 1036.7 | 0.042 |
| 1036.75 | 0.043 |
| 1036.8 | 0.043 |
| 1036.85 | 0.044 |
| 1036.9 | 0.044 |
| 1036.95 | 0.043 |
| 1037.0 | 0.043 |
| 1037.05 | 0.044 |
| 1037.1 | 0.045 |
| 1037.15 | 0.044 |
| 1037.2 | 0.043 |
| 1037.25 | 0.043 |
| 1037.3 | 0.042 |
| 1037.35 | 0.042 |
| 1037.4 | 0.041 |
| 1037.45 | 0.04 |
| 1037.5 | 0.039 |
| 1037.55 | 0.039 |
| 1037.6 | 0.038 |
| 1037.65 | 0.037 |
| 1037.7 | 0.037 |
| 1037.75 | 0.037 |
| 1037.8 | 0.037 |
| 1037.85 | 0.036 |
| 1037.9 | 0.037 |
| 1037.95 | 0.036 |
| 1038.0 | 0.038 |
| 1038.05 | 0.038 |
| 1038.1 | 0.038 |
| 1038.15 | 0.038 |
| 1038.2 | 0.038 |
| 1038.25 | 0.039 |
| 1038.3 | 0.038 |
| 1038.35 | 0.039 |
| 1038.4 | 0.038 |
| 1038.45 | 0.037 |
| 1038.5 | 0.038 |
| 1038.55 | 0.036 |
| 1038.6 | 0.035 |
| 1038.65 | 0.036 |
| 1038.7 | 0.036 |
| 1038.75 | 0.035 |
| 1038.8 | 0.033 |
| 1038.85 | 0.032 |
| 1038.9 | 0.031 |
| 1038.95 | 0.031 |
| 1039.0 | 0.032 |
| 1039.05 | 0.031 |
| 1039.1 | 0.031 |
| 1039.15 | 0.032 |
| 1039.2 | 0.031 |
| 1039.25 | 0.031 |
| 1039.3 | 0.031 |
| 1039.35 | 0.031 |
| 1039.4 | 0.032 |
| 1039.45 | 0.031 |
| 1039.5 | 0.032 |
| 1039.55 | 0.03 |
| 1039.6 | 0.03 |
| 1039.65 | 0.03 |
| 1039.7 | 0.031 |
| 1039.75 | 0.032 |
| 1039.8 | 0.032 |
| 1039.85 | 0.033 |
| 1039.9 | 0.033 |
| 1039.95 | 0.032 |
| 1040.0 | 0.033 |
| 1040.05 | 0.034 |
| 1040.1 | 0.035 |
| 1040.15 | 0.035 |
| 1040.2 | 0.035 |
| 1040.25 | 0.035 |
| 1040.3 | 0.034 |
| 1040.35 | 0.034 |
| 1040.4 | 0.033 |
| 1040.45 | 0.032 |
| 1040.5 | 0.031 |
| 1040.55 | 0.031 |
| 1040.6 | 0.029 |
| 1040.65 | 0.029 |
| 1040.7 | 0.029 |
| 1040.75 | 0.028 |
| 1040.8 | 0.028 |
| 1040.85 | 0.026 |
| 1040.9 | 0.028 |
| 1040.95 | 0.028 |
| 1041.0 | 0.028 |
| 1041.05 | 0.029 |
| 1041.1 | 0.029 |
| 1041.15 | 0.03 |
| 1041.2 | 0.029 |
| 1041.25 | 0.03 |
| 1041.3 | 0.03 |
| 1041.35 | 0.031 |
| 1041.4 | 0.032 |
| 1041.45 | 0.031 |
| 1041.5 | 0.031 |
| 1041.55 | 0.032 |
| 1041.6 | 0.032 |
| 1041.65 | 0.032 |
| 1041.7 | 0.031 |
| 1041.75 | 0.03 |
| 1041.8 | 0.029 |
| 1041.85 | 0.029 |
| 1041.9 | 0.029 |
| 1041.95 | 0.028 |
| 1042.0 | 0.027 |
| 1042.05 | 0.026 |
| 1042.1 | 0.024 |
| 1042.15 | 0.025 |
| 1042.2 | 0.025 |
| 1042.25 | 0.025 |
| 1042.3 | 0.026 |
| 1042.35 | 0.026 |
| 1042.4 | 0.027 |
| 1042.45 | 0.026 |
| 1042.5 | 0.027 |
| 1042.55 | 0.027 |
| 1042.6 | 0.028 |
| 1042.65 | 0.029 |
| 1042.7 | 0.028 |
| 1042.75 | 0.027 |
| 1042.8 | 0.027 |
| 1042.85 | 0.027 |
| 1042.9 | 0.026 |
| 1042.95 | 0.026 |
| 1043.0 | 0.026 |
| 1043.05 | 0.025 |
| 1043.1 | 0.026 |
| 1043.15 | 0.026 |
| 1043.2 | 0.026 |
| 1043.25 | 0.026 |
| 1043.3 | 0.026 |
| 1043.35 | 0.026 |
| 1043.4 | 0.027 |
| 1043.45 | 0.027 |
| 1043.5 | 0.027 |
| 1043.55 | 0.027 |
| 1043.6 | 0.027 |
| 1043.65 | 0.026 |
| 1043.7 | 0.024 |
| 1043.75 | 0.024 |
| 1043.8 | 0.023 |
| 1043.85 | 0.023 |
| 1043.9 | 0.022 |
| 1043.95 | 0.021 |
| 1044.0 | 0.021 |
| 1044.05 | 0.02 |
| 1044.1 | 0.02 |
| 1044.15 | 0.019 |
| 1044.2 | 0.019 |
| 1044.25 | 0.02 |
| 1044.3 | 0.02 |
| 1044.35 | 0.022 |
| 1044.4 | 0.022 |
| 1044.45 | 0.022 |
| 1044.5 | 0.021 |
| 1044.55 | 0.022 |
| 1044.6 | 0.023 |
| 1044.65 | 0.023 |
| 1044.7 | 0.023 |
| 1044.75 | 0.023 |
| 1044.8 | 0.022 |
| 1044.85 | 0.022 |
| 1044.9 | 0.02 |
| 1044.95 | 0.021 |
| 1045.0 | 0.02 |
| 1045.05 | 0.02 |
| 1045.1 | 0.019 |
| 1045.15 | 0.018 |
| 1045.2 | 0.018 |
| 1045.25 | 0.017 |
| 1045.3 | 0.017 |
| 1045.35 | 0.018 |
| 1045.4 | 0.017 |
| 1045.45 | 0.016 |
| 1045.5 | 0.017 |
| 1045.55 | 0.017 |
| 1045.6 | 0.017 |
| 1045.65 | 0.017 |
| 1045.7 | 0.017 |
| 1045.75 | 0.017 |
| 1045.8 | 0.017 |
| 1045.85 | 0.018 |
| 1045.9 | 0.018 |
| 1045.95 | 0.017 |
| 1046.0 | 0.018 |
| 1046.05 | 0.018 |
| 1046.1 | 0.017 |
| 1046.15 | 0.017 |
| 1046.2 | 0.017 |
| 1046.25 | 0.017 |
| 1046.3 | 0.017 |
| 1046.35 | 0.017 |
| 1046.4 | 0.016 |
| 1046.45 | 0.016 |
| 1046.5 | 0.015 |
| 1046.55 | 0.015 |
| 1046.6 | 0.015 |
| 1046.65 | 0.015 |
| 1046.7 | 0.015 |
| 1046.75 | 0.015 |
| 1046.8 | 0.015 |
| 1046.85 | 0.014 |
| 1046.9 | 0.014 |
| 1046.95 | 0.015 |
| 1047.0 | 0.015 |
| 1047.05 | 0.015 |
| 1047.1 | 0.014 |
| 1047.15 | 0.014 |
| 1047.2 | 0.014 |
| 1047.25 | 0.014 |
| 1047.3 | 0.014 |
| 1047.35 | 0.013 |
| 1047.4 | 0.013 |
| 1047.45 | 0.014 |
| 1047.5 | 0.014 |
| 1047.55 | 0.014 |
| 1047.6 | 0.014 |
| 1047.65 | 0.013 |
| 1047.7 | 0.013 |
| 1047.75 | 0.013 |
| 1047.8 | 0.014 |
| 1047.85 | 0.012 |
| 1047.9 | 0.014 |
| 1047.95 | 0.014 |
| 1048.0 | 0.013 |
| 1048.05 | 0.012 |
| 1048.1 | 0.012 |
| 1048.15 | 0.013 |
| 1048.2 | 0.013 |
| 1048.25 | 0.012 |
| 1048.3 | 0.012 |
| 1048.35 | 0.012 |
| 1048.4 | 0.013 |
| 1048.45 | 0.012 |
| 1048.5 | 0.013 |
| 1048.55 | 0.012 |
| 1048.6 | 0.013 |
| 1048.65 | 0.012 |
| 1048.7 | 0.011 |
| 1048.75 | 0.012 |
| 1048.8 | 0.012 |
| 1048.85 | 0.012 |
| 1048.9 | 0.011 |
| 1048.95 | 0.011 |
| 1049.0 | 0.011 |
| 1049.05 | 0.01 |
| 1049.1 | 0.01 |
| 1049.15 | 0.009 |
| 1049.2 | 0.009 |
| 1049.25 | 0.009 |
| 1049.3 | 0.01 |
| 1049.35 | 0.011 |
| 1049.4 | 0.011 |
| 1049.45 | 0.012 |
| 1049.5 | 0.012 |
| 1049.55 | 0.013 |
| 1049.6 | 0.013 |
| 1049.65 | 0.013 |
| 1049.7 | 0.012 |
| 1049.75 | 0.012 |
| 1049.8 | 0.013 |
| 1049.85 | 0.013 |
| 1049.9 | 0.013 |
| 1049.95 | 0.012 |
| 1050.0 | 0.011 |
| 1050.05 | 0.011 |
| 1050.1 | 0.011 |
| 1050.15 | 0.011 |
| 1050.2 | 0.011 |
| 1050.25 | 0.011 |
| 1050.3 | 0.012 |
| 1050.35 | 0.011 |
| 1050.4 | 0.011 |
| 1050.45 | 0.01 |
| 1050.5 | 0.011 |
| 1050.55 | 0.011 |
| 1050.6 | 0.011 |
| 1050.65 | 0.01 |
| 1050.7 | 0.009 |
| 1050.75 | 0.009 |
| 1050.8 | 0.01 |
| 1050.85 | 0.009 |
| 1050.9 | 0.009 |
| 1050.95 | 0.009 |
| 1051.0 | 0.009 |
| 1051.05 | 0.009 |
| 1051.1 | 0.008 |
| 1051.15 | 0.008 |
| 1051.2 | 0.01 |
| 1051.25 | 0.01 |
| 1051.3 | 0.01 |
| 1051.35 | 0.01 |
| 1051.4 | 0.011 |
| 1051.45 | 0.01 |
| 1051.5 | 0.01 |
| 1051.55 | 0.01 |
| 1051.6 | 0.01 |
| 1051.65 | 0.01 |
| 1051.7 | 0.01 |
| 1051.75 | 0.009 |
| 1051.8 | 0.009 |
| 1051.85 | 0.007 |
| 1051.9 | 0.008 |
| 1051.95 | 0.007 |
| 1052.0 | 0.006 |
| 1052.05 | 0.006 |
| 1052.1 | 0.005 |
| 1052.15 | 0.005 |
| 1052.2 | 0.006 |
| 1052.25 | 0.007 |
| 1052.3 | 0.006 |
| 1052.35 | 0.008 |
| 1052.4 | 0.008 |
| 1052.45 | 0.008 |
| 1052.5 | 0.01 |
| 1052.55 | 0.011 |
| 1052.6 | 0.012 |
| 1052.65 | 0.012 |
| 1052.7 | 0.011 |
| 1052.75 | 0.011 |
| 1052.8 | 0.011 |
| 1052.85 | 0.01 |
| 1052.9 | 0.009 |
| 1052.95 | 0.009 |
| 1053.0 | 0.008 |
| 1053.05 | 0.007 |
| 1053.1 | 0.006 |
| 1053.15 | 0.005 |
| 1053.2 | 0.006 |
| 1053.25 | 0.006 |
| 1053.3 | 0.006 |
| 1053.35 | 0.007 |
| 1053.4 | 0.006 |
| 1053.45 | 0.006 |
| 1053.5 | 0.007 |
| 1053.55 | 0.009 |
| 1053.6 | 0.008 |
| 1053.65 | 0.008 |
| 1053.7 | 0.008 |
| 1053.75 | 0.007 |
| 1053.8 | 0.006 |
| 1053.85 | 0.006 |
| 1053.9 | 0.006 |
| 1053.95 | 0.007 |
| 1054.0 | 0.007 |
| 1054.05 | 0.005 |
| 1054.1 | 0.004 |
| 1054.15 | 0.004 |
| 1054.2 | 0.003 |
| 1054.25 | 0.003 |
| 1054.3 | 0.002 |
| 1054.35 | 0.001 |
| 1054.4 | 0.001 |
| 1054.45 | 0 |
| 1054.5 | 0 |
| 1054.55 | 0 |
| 1054.6 | 0.001 |
| 1054.65 | 0.001 |
| 1054.7 | 0 |
| 1054.75 | 0.001 |
| 1054.8 | 0.001 |
| 1054.85 | 0.001 |
| 1054.9 | 0.001 |
| 1054.95 | 0.001 |
| 1055.0 | 0.001 |
| 1055.05 | 0.001 |
| 1055.1 | 0.002 |
| 1055.15 | 0.002 |
| 1055.2 | 0.003 |
| 1055.25 | 0.004 |
| 1055.3 | 0.004 |
| 1055.35 | 0.004 |
| 1055.4 | 0.003 |
| 1055.45 | 0.003 |
| 1055.5 | 0.004 |
| 1055.55 | 0.004 |
| 1055.6 | 0.005 |
| 1055.65 | 0.004 |
| 1055.7 | 0.005 |
| 1055.75 | 0.005 |
| 1055.8 | 0.006 |
| 1055.85 | 0.005 |
| 1055.9 | 0.005 |
| 1055.95 | 0.005 |
| 1056.0 | 0.007 |
| 1056.05 | 0.007 |
| 1056.1 | 0.007 |
| 1056.15 | 0.006 |
| 1056.2 | 0.006 |
| 1056.25 | 0.005 |
| 1056.3 | 0.005 |
| 1056.35 | 0.003 |
| 1056.4 | 0.003 |
| 1056.45 | 0.004 |
| 1056.5 | 0.004 |
| 1056.55 | 0.003 |
| 1056.6 | 0.003 |
| 1056.65 | 0.001 |
| 1056.7 | 0.002 |
| 1056.75 | 0.003 |
| 1056.8 | 0.003 |
| 1056.85 | 0.002 |
| 1056.9 | 0.003 |
| 1056.95 | 0.003 |
| 1057.0 | 0.002 |
| 1057.05 | 0.002 |
| 1057.1 | 0.003 |
| 1057.15 | 0.003 |
| 1057.2 | 0.003 |
| 1057.25 | 0.003 |
| 1057.3 | 0.002 |
| 1057.35 | 0.003 |
| 1057.4 | 0.005 |
| 1057.45 | 0.005 |
| 1057.5 | 0.006 |
| 1057.55 | 0.005 |
| 1057.6 | 0.004 |
| 1057.65 | 0.004 |
| 1057.7 | 0.004 |
| 1057.75 | 0.004 |
| 1057.8 | 0.004 |
| 1057.85 | 0.005 |
| 1057.9 | 0.004 |
| 1057.95 | 0.002 |
| 1058.0 | 0.002 |
| 1058.05 | 0.001 |
| 1058.1 | 0.002 |
| 1058.15 | 0.002 |
| 1058.2 | 0.003 |
| 1058.25 | 0.003 |
| 1058.3 | 0.003 |
| 1058.35 | 0.002 |
| 1058.4 | 0.003 |
| 1058.45 | 0.004 |
| 1058.5 | 0.004 |
| 1058.55 | 0.003 |
| 1058.6 | 0.003 |
| 1058.65 | 0.004 |
| 1058.7 | 0.004 |
| 1058.75 | 0.003 |
| 1058.8 | 0.003 |
| 1058.85 | 0.002 |
| 1058.9 | 0.003 |
| 1058.95 | 0.003 |
| 1059.0 | 0.003 |
| 1059.05 | 0.004 |
| 1059.1 | 0.005 |
| 1059.15 | 0.006 |
| 1059.2 | 0.005 |
| 1059.25 | 0.005 |
| 1059.3 | 0.005 |
| 1059.35 | 0.006 |
| 1059.4 | 0.006 |
| 1059.45 | 0.005 |
| 1059.5 | 0.005 |
| 1059.55 | 0.004 |
| 1059.6 | 0.005 |
| 1059.65 | 0.005 |
| 1059.7 | 0.007 |
| 1059.75 | 0.007 |
| 1059.8 | 0.006 |
| 1059.85 | 0.006 |
| 1059.9 | 0.006 |
| 1059.95 | 0.006 |
| 1060.0 | 0.006 |
| 1060.05 | 0.006 |
| 1060.1 | 0.006 |
| 1060.15 | 0.006 |
| 1060.2 | 0.005 |
| 1060.25 | 0.004 |
| 1060.3 | 0.004 |
| 1060.35 | 0.004 |
| 1060.4 | 0.005 |
| 1060.45 | 0.005 |
| 1060.5 | 0.006 |
| 1060.55 | 0.005 |
| 1060.6 | 0.005 |
| 1060.65 | 0.006 |
| 1060.7 | 0.007 |
| 1060.75 | 0.006 |
| 1060.8 | 0.008 |
| 1060.85 | 0.008 |
| 1060.9 | 0.007 |
| 1060.95 | 0.006 |
| 1061.0 | 0.007 |
| 1061.05 | 0.007 |
| 1061.1 | 0.007 |
| 1061.15 | 0.006 |
| 1061.2 | 0.006 |
| 1061.25 | 0.006 |
| 1061.3 | 0.006 |
| 1061.35 | 0.005 |
| 1061.4 | 0.005 |
| 1061.45 | 0.007 |
| 1061.5 | 0.006 |
| 1061.55 | 0.004 |
| 1061.6 | 0.003 |
| 1061.65 | 0.003 |
| 1061.7 | 0.004 |
| 1061.75 | 0.003 |
| 1061.8 | 0.001 |
| 1061.85 | 0.002 |
| 1061.9 | 0.002 |
| 1061.95 | 0.002 |
| 1062.0 | 0.003 |
| 1062.05 | 0.002 |
| 1062.1 | 0.003 |
| 1062.15 | 0.003 |
| 1062.2 | 0.003 |
| 1062.25 | 0.003 |
| 1062.3 | 0.004 |
| 1062.35 | 0.004 |
| 1062.4 | 0.004 |
| 1062.45 | 0.005 |
| 1062.5 | 0.004 |
| 1062.55 | 0.003 |
| 1062.6 | 0.005 |
| 1062.65 | 0.005 |
| 1062.7 | 0.006 |
| 1062.75 | 0.007 |
| 1062.8 | 0.006 |
| 1062.85 | 0.005 |
| 1062.9 | 0.006 |
| 1062.95 | 0.006 |
| 1063.0 | 0.004 |
| 1063.05 | 0.005 |
| 1063.1 | 0.006 |
| 1063.15 | 0.005 |
| 1063.2 | 0.004 |
| 1063.25 | 0.004 |
| 1063.3 | 0.004 |
| 1063.35 | 0.004 |
| 1063.4 | 0.005 |
| 1063.45 | 0.005 |
| 1063.5 | 0.006 |
| 1063.55 | 0.006 |
| 1063.6 | 0.006 |
| 1063.65 | 0.006 |
| 1063.7 | 0.006 |
| 1063.75 | 0.007 |
| 1063.8 | 0.007 |
| 1063.85 | 0.006 |
| 1063.9 | 0.006 |
| 1063.95 | 0.006 |
| 1064.0 | 0.006 |
| 1064.05 | 0.006 |
| 1064.1 | 0.006 |
| 1064.15 | 0.005 |
| 1064.2 | 0.005 |
| 1064.25 | 0.005 |
| 1064.3 | 0.004 |
| 1064.35 | 0.005 |
| 1064.4 | 0.005 |
| 1064.45 | 0.005 |
| 1064.5 | 0.004 |
| 1064.55 | 0.004 |
| 1064.6 | 0.005 |
| 1064.65 | 0.004 |
| 1064.7 | 0.004 |
| 1064.75 | 0.004 |
| 1064.8 | 0.003 |
| 1064.85 | 0.004 |
| 1064.9 | 0.004 |
| 1064.95 | 0.004 |
| 1065.0 | 0.004 |
| 1065.05 | 0.004 |
| 1065.1 | 0.003 |
| 1065.15 | 0.002 |
| 1065.2 | 0.003 |
| 1065.25 | 0.003 |
| 1065.3 | 0.004 |
| 1065.35 | 0.005 |
| 1065.4 | 0.004 |
| 1065.45 | 0.003 |
| 1065.5 | 0.003 |
| 1065.55 | 0.003 |
| 1065.6 | 0.003 |
| 1065.65 | 0.004 |
| 1065.7 | 0.004 |
| 1065.75 | 0.003 |
| 1065.8 | 0.002 |
| 1065.85 | 0.002 |
| 1065.9 | 0.002 |
| 1065.95 | 0.002 |
| 1066.0 | 0.003 |
| 1066.05 | 0.003 |
| 1066.1 | 0.004 |
| 1066.15 | 0.003 |
| 1066.2 | 0.004 |
| 1066.25 | 0.004 |
| 1066.3 | 0.005 |
| 1066.35 | 0.006 |
| 1066.4 | 0.005 |
| 1066.45 | 0.004 |
| 1066.5 | 0.004 |
| 1066.55 | 0.003 |
| 1066.6 | 0.003 |
| 1066.65 | 0.003 |
| 1066.7 | 0.003 |
| 1066.75 | 0.002 |
| 1066.8 | 0.002 |
| 1066.85 | 0.002 |
| 1066.9 | 0.003 |
| 1066.95 | 0.003 |
| 1067.0 | 0.003 |
| 1067.05 | 0.003 |
| 1067.1 | 0.004 |
| 1067.15 | 0.004 |
| 1067.2 | 0.004 |
| 1067.25 | 0.005 |
| 1067.3 | 0.005 |
| 1067.35 | 0.005 |
| 1067.4 | 0.005 |
| 1067.45 | 0.004 |
| 1067.5 | 0.005 |
| 1067.55 | 0.004 |
| 1067.6 | 0.006 |
| 1067.65 | 0.005 |
| 1067.7 | 0.004 |
| 1067.75 | 0.005 |
| 1067.8 | 0.005 |
| 1067.85 | 0.004 |
| 1067.9 | 0.004 |
| 1067.95 | 0.003 |
| 1068.0 | 0.002 |
| 1068.05 | 0.003 |
| 1068.1 | 0.003 |
| 1068.15 | 0.003 |
| 1068.2 | 0.003 |
| 1068.25 | 0.002 |
| 1068.3 | 0.001 |
| 1068.35 | 0.001 |
| 1068.4 | 0.001 |
| 1068.45 | 0.002 |
| 1068.5 | 0.002 |
| 1068.55 | 0.003 |
| 1068.6 | 0.002 |
| 1068.65 | 0.001 |
| 1068.7 | 0.001 |
| 1068.75 | 0.001 |
| 1068.8 | 0.003 |
| 1068.85 | 0.002 |
| 1068.9 | 0.003 |
| 1068.95 | 0.003 |
| 1069.0 | 0.003 |
| 1069.05 | 0.004 |
| 1069.1 | 0.003 |
| 1069.15 | 0.004 |
| 1069.2 | 0.003 |
| 1069.25 | 0.004 |
| 1069.3 | 0.004 |
| 1069.35 | 0.003 |
| 1069.4 | 0.005 |
| 1069.45 | 0.004 |
| 1069.5 | 0.003 |
| 1069.55 | 0.003 |
| 1069.6 | 0.004 |
| 1069.65 | 0.004 |
| 1069.7 | 0.006 |
| 1069.75 | 0.007 |
| 1069.8 | 0.006 |
| 1069.85 | 0.007 |
| 1069.9 | 0.007 |
| 1069.95 | 0.007 |
| 1070.0 | 0.007 |
| 1070.05 | 0.008 |
| 1070.1 | 0.007 |
| 1070.15 | 0.005 |
| 1070.2 | 0.004 |
| 1070.25 | 0.004 |
| 1070.3 | 0.003 |
| 1070.35 | 0.003 |
| 1070.4 | 0.003 |
| 1070.45 | 0.004 |
| 1070.5 | 0.003 |
| 1070.55 | 0.003 |
| 1070.6 | 0.002 |
| 1070.65 | 0.003 |
| 1070.7 | 0.004 |
| 1070.75 | 0.005 |
| 1070.8 | 0.005 |
| 1070.85 | 0.004 |
| 1070.9 | 0.004 |
| 1070.95 | 0.005 |
| 1071.0 | 0.003 |
| 1071.05 | 0.003 |
| 1071.1 | 0.003 |
| 1071.15 | 0.002 |
| 1071.2 | 0.002 |
| 1071.25 | 0.002 |
| 1071.3 | 0.002 |
| 1071.35 | 0.001 |
| 1071.4 | 0.001 |
| 1071.45 | 0.001 |
| 1071.5 | 0.001 |
| 1071.55 | 0.001 |
| 1071.6 | 0.001 |
| 1071.65 | 0 |
| 1071.7 | 0.001 |
| 1071.75 | -0.001 |
| 1071.8 | -0.001 |
| 1071.85 | -0.001 |
| 1071.9 | -0.001 |
| 1071.95 | 0 |
| 1072.0 | -0.002 |
| 1072.05 | -0.003 |
| 1072.1 | -0.003 |
| 1072.15 | -0.002 |
| 1072.2 | -0.001 |
| 1072.25 | -0.002 |
| 1072.3 | -0.001 |
| 1072.35 | -0.001 |
| 1072.4 | -0.001 |
| 1072.45 | -0.001 |
| 1072.5 | -0.001 |
| 1072.55 | -0.001 |
| 1072.6 | 0 |
| 1072.65 | -0.001 |
| 1072.7 | -0.001 |
| 1072.75 | -0.002 |
| 1072.8 | -0.002 |
| 1072.85 | -0.002 |
| 1072.9 | -0.002 |
| 1072.95 | -0.002 |
| 1073.0 | -0.002 |
| 1073.05 | -0.002 |
| 1073.1 | -0.002 |
| 1073.15 | -0.002 |
| 1073.2 | -0.001 |
| 1073.25 | -0.002 |
| 1073.3 | -0.002 |
| 1073.35 | -0.002 |
| 1073.4 | -0.002 |
| 1073.45 | -0.002 |
| 1073.5 | -0.003 |
| 1073.55 | -0.003 |
| 1073.6 | -0.002 |
| 1073.65 | -0.002 |
| 1073.7 | -0.002 |
| 1073.75 | -0.003 |
| 1073.8 | -0.002 |
| 1073.85 | -0.001 |
| 1073.9 | -0.001 |
| 1073.95 | 0 |
| 1074.0 | 0 |
| 1074.05 | 0.002 |
| 1074.1 | 0.002 |
| 1074.15 | 0.002 |
| 1074.2 | 0.001 |
| 1074.25 | 0.001 |
| 1074.3 | 0.001 |
| 1074.35 | 0 |
| 1074.4 | 0 |
| 1074.45 | 0 |
| 1074.5 | 0 |
| 1074.55 | 0 |
| 1074.6 | -0.002 |
| 1074.65 | -0.002 |
| 1074.7 | -0.003 |
| 1074.75 | -0.004 |
| 1074.8 | -0.003 |
| 1074.85 | -0.004 |
| 1074.9 | -0.004 |
| 1074.95 | -0.004 |
| 1075.0 | -0.006 |
| 1075.05 | -0.006 |
| 1075.1 | -0.007 |
| 1075.15 | -0.007 |
| 1075.2 | -0.006 |
| 1075.25 | -0.005 |
| 1075.3 | -0.005 |
| 1075.35 | -0.006 |
| 1075.4 | -0.006 |
| 1075.45 | -0.007 |
| 1075.5 | -0.006 |
| 1075.55 | -0.005 |
| 1075.6 | -0.006 |
| 1075.65 | -0.006 |
| 1075.7 | -0.006 |
| 1075.75 | -0.006 |
| 1075.8 | -0.006 |
| 1075.85 | -0.006 |
| 1075.9 | -0.005 |
| 1075.95 | -0.005 |
| 1076.0 | -0.004 |
| 1076.05 | -0.004 |
| 1076.1 | -0.004 |
| 1076.15 | -0.003 |
| 1076.2 | -0.003 |
| 1076.25 | -0.002 |
| 1076.3 | -0.001 |
| 1076.35 | -0.002 |
| 1076.4 | -0.002 |
| 1076.45 | -0.001 |
| 1076.5 | -0.001 |
| 1076.55 | -0.001 |
| 1076.6 | -0.002 |
| 1076.65 | -0.002 |
| 1076.7 | -0.001 |
| 1076.75 | -0.002 |
| 1076.8 | -0.003 |
| 1076.85 | -0.003 |
| 1076.9 | -0.003 |
| 1076.95 | -0.004 |
| 1077.0 | -0.005 |
| 1077.05 | -0.004 |
| 1077.1 | -0.004 |
| 1077.15 | -0.004 |
| 1077.2 | -0.004 |
| 1077.25 | -0.004 |
| 1077.3 | -0.005 |
| 1077.35 | -0.003 |
| 1077.4 | -0.003 |
| 1077.45 | -0.002 |
| 1077.5 | -0.002 |
| 1077.55 | -0.002 |
| 1077.6 | -0.004 |
| 1077.65 | -0.003 |
| 1077.7 | -0.003 |
| 1077.75 | -0.003 |
| 1077.8 | -0.004 |
| 1077.85 | -0.003 |
| 1077.9 | -0.004 |
| 1077.95 | -0.004 |
| 1078.0 | -0.004 |
| 1078.05 | -0.004 |
| 1078.1 | -0.003 |
| 1078.15 | -0.003 |
| 1078.2 | -0.003 |
| 1078.25 | -0.003 |
| 1078.3 | -0.002 |
| 1078.35 | -0.002 |
| 1078.4 | -0.003 |
| 1078.45 | -0.003 |
| 1078.5 | -0.003 |
| 1078.55 | -0.003 |
| 1078.6 | -0.003 |
| 1078.65 | -0.004 |
| 1078.7 | -0.003 |
| 1078.75 | -0.003 |
| 1078.8 | -0.003 |
| 1078.85 | -0.004 |
| 1078.9 | -0.004 |
| 1078.95 | -0.004 |
| 1079.0 | -0.006 |
| 1079.05 | -0.006 |
| 1079.1 | -0.003 |
| 1079.15 | -0.003 |
| 1079.2 | -0.003 |
| 1079.25 | -0.004 |
| 1079.3 | -0.004 |
| 1079.35 | -0.005 |
| 1079.4 | -0.004 |
| 1079.45 | -0.004 |
| 1079.5 | -0.004 |
| 1079.55 | -0.004 |
| 1079.6 | -0.005 |
| 1079.65 | -0.006 |
| 1079.7 | -0.006 |
| 1079.75 | -0.005 |
| 1079.8 | -0.005 |
| 1079.85 | -0.006 |
| 1079.9 | -0.006 |
| 1079.95 | -0.005 |
| 1080.0 | -0.005 |
| 1080.05 | -0.005 |
| 1080.1 | -0.003 |
| 1080.15 | -0.003 |
| 1080.2 | -0.002 |
| 1080.25 | -0.003 |
| 1080.3 | -0.004 |
| 1080.35 | -0.003 |
| 1080.4 | -0.003 |
| 1080.45 | -0.002 |
| 1080.5 | -0.002 |
| 1080.55 | -0.003 |
| 1080.6 | -0.003 |
| 1080.65 | -0.004 |
| 1080.7 | -0.004 |
| 1080.75 | -0.005 |
| 1080.8 | -0.004 |
| 1080.85 | -0.004 |
| 1080.9 | -0.005 |
| 1080.95 | -0.005 |
| 1081.0 | -0.005 |
| 1081.05 | -0.005 |
| 1081.1 | -0.006 |
| 1081.15 | -0.006 |
| 1081.2 | -0.006 |
| 1081.25 | -0.005 |
| 1081.3 | -0.006 |
| 1081.35 | -0.006 |
| 1081.4 | -0.006 |
| 1081.45 | -0.006 |
| 1081.5 | -0.005 |
| 1081.55 | -0.006 |
| 1081.6 | -0.005 |
| 1081.65 | -0.005 |
| 1081.7 | -0.004 |
| 1081.75 | -0.004 |
| 1081.8 | -0.004 |
| 1081.85 | -0.003 |
| 1081.9 | -0.003 |
| 1081.95 | -0.003 |
| 1082.0 | -0.002 |
| 1082.05 | -0.003 |
| 1082.1 | -0.003 |
| 1082.15 | -0.002 |
| 1082.2 | -0.002 |
| 1082.25 | -0.004 |
| 1082.3 | -0.003 |
| 1082.35 | -0.003 |
| 1082.4 | -0.004 |
| 1082.45 | -0.004 |
| 1082.5 | -0.004 |
| 1082.55 | -0.005 |
| 1082.6 | -0.005 |
| 1082.65 | -0.005 |
| 1082.7 | -0.006 |
| 1082.75 | -0.006 |
| 1082.8 | -0.006 |
| 1082.85 | -0.006 |
| 1082.9 | -0.007 |
| 1082.95 | -0.007 |
| 1083.0 | -0.007 |
| 1083.05 | -0.007 |
| 1083.1 | -0.007 |
| 1083.15 | -0.005 |
| 1083.2 | -0.006 |
| 1083.25 | -0.005 |
| 1083.3 | -0.005 |
| 1083.35 | -0.006 |
| 1083.4 | -0.004 |
| 1083.45 | -0.002 |
| 1083.5 | -0.002 |
| 1083.55 | -0.001 |
| 1083.6 | -0.002 |
| 1083.65 | -0.001 |
| 1083.7 | -0.001 |
| 1083.75 | -0.001 |
| 1083.8 | -0.001 |
| 1083.85 | -0.001 |
| 1083.9 | -0.001 |
| 1083.95 | -0.001 |
| 1084.0 | -0.003 |
| 1084.05 | -0.003 |
| 1084.1 | -0.004 |
| 1084.15 | -0.004 |
| 1084.2 | -0.004 |
| 1084.25 | -0.004 |
| 1084.3 | -0.005 |
| 1084.35 | -0.004 |
| 1084.4 | -0.004 |
| 1084.45 | -0.003 |
| 1084.5 | -0.003 |
| 1084.55 | -0.001 |
| 1084.6 | 0 |
| 1084.65 | -0.001 |
| 1084.7 | 0 |
| 1084.75 | 0 |
| 1084.8 | 0 |
| 1084.85 | 0 |
| 1084.9 | 0 |
| 1084.95 | -0.001 |
| 1085.0 | -0.001 |
| 1085.05 | 0 |
| 1085.1 | 0 |
| 1085.15 | -0.001 |
| 1085.2 | 0 |
| 1085.25 | 0 |
| 1085.3 | 0.001 |
| 1085.35 | 0.001 |
| 1085.4 | 0.001 |
| 1085.45 | 0 |
| 1085.5 | 0.001 |
| 1085.55 | 0 |
| 1085.6 | 0 |
| 1085.65 | 0 |
| 1085.7 | 0 |
| 1085.75 | 0 |
| 1085.8 | 0.001 |
| 1085.85 | 0.001 |
| 1085.9 | 0.001 |
| 1085.95 | 0.001 |
| 1086.0 | 0.002 |
| 1086.05 | 0.002 |
| 1086.1 | 0.002 |
| 1086.15 | 0.003 |
| 1086.2 | 0.002 |
| 1086.25 | 0.002 |
| 1086.3 | 0.001 |
| 1086.35 | 0.001 |
| 1086.4 | 0 |
| 1086.45 | -0.001 |
| 1086.5 | 0 |
| 1086.55 | -0.001 |
| 1086.6 | -0.001 |
| 1086.65 | -0.001 |
| 1086.7 | 0 |
| 1086.75 | 0 |
| 1086.8 | 0 |
| 1086.85 | 0 |
| 1086.9 | 0.001 |
| 1086.95 | 0.001 |
| 1087.0 | 0.003 |
| 1087.05 | 0.003 |
| 1087.1 | 0.003 |
| 1087.15 | 0.002 |
| 1087.2 | 0.001 |
| 1087.25 | 0 |
| 1087.3 | 0 |
| 1087.35 | 0 |
| 1087.4 | -0.001 |
| 1087.45 | -0.002 |
| 1087.5 | -0.003 |
| 1087.55 | -0.004 |
| 1087.6 | -0.004 |
| 1087.65 | -0.004 |
| 1087.7 | -0.004 |
| 1087.75 | -0.004 |
| 1087.8 | -0.003 |
| 1087.85 | -0.003 |
| 1087.9 | -0.004 |
| 1087.95 | -0.004 |
| 1088.0 | -0.002 |
| 1088.05 | -0.003 |
| 1088.1 | -0.003 |
| 1088.15 | -0.002 |
| 1088.2 | -0.003 |
| 1088.25 | -0.004 |
| 1088.3 | -0.004 |
| 1088.35 | -0.005 |
| 1088.4 | -0.006 |
| 1088.45 | -0.005 |
| 1088.5 | -0.007 |
| 1088.55 | -0.007 |
| 1088.6 | -0.007 |
| 1088.65 | -0.008 |
| 1088.7 | -0.009 |
| 1088.75 | -0.008 |
| 1088.8 | -0.007 |
| 1088.85 | -0.007 |
| 1088.9 | -0.008 |
| 1088.95 | -0.008 |
| 1089.0 | -0.008 |
| 1089.05 | -0.008 |
| 1089.1 | -0.008 |
| 1089.15 | -0.008 |
| 1089.2 | -0.008 |
| 1089.25 | -0.007 |
| 1089.3 | -0.008 |
| 1089.35 | -0.009 |
| 1089.4 | -0.008 |
| 1089.45 | -0.007 |
| 1089.5 | -0.007 |
| 1089.55 | -0.006 |
| 1089.6 | -0.005 |
| 1089.65 | -0.006 |
| 1089.7 | -0.005 |
| 1089.75 | -0.005 |
| 1089.8 | -0.005 |
| 1089.85 | -0.004 |
| 1089.9 | -0.003 |
| 1089.95 | -0.004 |
| 1090.0 | -0.005 |
| 1090.05 | -0.005 |
| 1090.1 | -0.005 |
| 1090.15 | -0.006 |
| 1090.2 | -0.007 |
| 1090.25 | -0.007 |
| 1090.3 | -0.007 |
| 1090.35 | -0.008 |
| 1090.4 | -0.009 |
| 1090.45 | -0.01 |
| 1090.5 | -0.009 |
| 1090.55 | -0.008 |
| 1090.6 | -0.009 |
| 1090.65 | -0.009 |
| 1090.7 | -0.008 |
| 1090.75 | -0.007 |
| 1090.8 | -0.008 |
| 1090.85 | -0.008 |
| 1090.9 | -0.007 |
| 1090.95 | -0.007 |
| 1091.0 | -0.007 |
| 1091.05 | -0.008 |
| 1091.1 | -0.007 |
| 1091.15 | -0.007 |
| 1091.2 | -0.007 |
| 1091.25 | -0.008 |
| 1091.3 | -0.008 |
| 1091.35 | -0.008 |
| 1091.4 | -0.009 |
| 1091.45 | -0.009 |
| 1091.5 | -0.009 |
| 1091.55 | -0.009 |
| 1091.6 | -0.009 |
| 1091.65 | -0.01 |
| 1091.7 | -0.01 |
| 1091.75 | -0.011 |
| 1091.8 | -0.011 |
| 1091.85 | -0.011 |
| 1091.9 | -0.012 |
| 1091.95 | -0.012 |
| 1092.0 | -0.013 |
| 1092.05 | -0.014 |
| 1092.1 | -0.015 |
| 1092.15 | -0.015 |
| 1092.2 | -0.016 |
| 1092.25 | -0.017 |
| 1092.3 | -0.016 |
| 1092.35 | -0.016 |
| 1092.4 | -0.017 |
| 1092.45 | -0.017 |
| 1092.5 | -0.017 |
| 1092.55 | -0.017 |
| 1092.6 | -0.015 |
| 1092.65 | -0.016 |
| 1092.7 | -0.015 |
| 1092.75 | -0.015 |
| 1092.8 | -0.015 |
| 1092.85 | -0.015 |
| 1092.9 | -0.016 |
| 1092.95 | -0.016 |
| 1093.0 | -0.015 |
| 1093.05 | -0.016 |
| 1093.1 | -0.016 |
| 1093.15 | -0.016 |
| 1093.2 | -0.016 |
| 1093.25 | -0.017 |
| 1093.3 | -0.018 |
| 1093.35 | -0.017 |
| 1093.4 | -0.018 |
| 1093.45 | -0.018 |
| 1093.5 | -0.018 |
| 1093.55 | -0.018 |
| 1093.6 | -0.019 |
| 1093.65 | -0.019 |
| 1093.7 | -0.02 |
| 1093.75 | -0.019 |
| 1093.8 | -0.018 |
| 1093.85 | -0.018 |
| 1093.9 | -0.018 |
| 1093.95 | -0.018 |
| 1094.0 | -0.018 |
| 1094.05 | -0.018 |
| 1094.1 | -0.017 |
| 1094.15 | -0.015 |
| 1094.2 | -0.015 |
| 1094.25 | -0.015 |
| 1094.3 | -0.015 |
| 1094.35 | -0.016 |
| 1094.4 | -0.015 |
| 1094.45 | -0.016 |
| 1094.5 | -0.017 |
| 1094.55 | -0.016 |
| 1094.6 | -0.016 |
| 1094.65 | -0.017 |
| 1094.7 | -0.019 |
| 1094.75 | -0.019 |
| 1094.8 | -0.018 |
| 1094.85 | -0.017 |
| 1094.9 | -0.018 |
| 1094.95 | -0.018 |
| 1095.0 | -0.017 |
| 1095.05 | -0.017 |
| 1095.1 | -0.018 |
| 1095.15 | -0.019 |
| 1095.2 | -0.019 |
| 1095.25 | -0.019 |
| 1095.3 | -0.019 |
| 1095.35 | -0.019 |
| 1095.4 | -0.02 |
| 1095.45 | -0.019 |
| 1095.5 | -0.019 |
| 1095.55 | -0.019 |
| 1095.6 | -0.02 |
| 1095.65 | -0.018 |
| 1095.7 | -0.019 |
| 1095.75 | -0.017 |
| 1095.8 | -0.017 |
| 1095.85 | -0.017 |
| 1095.9 | -0.02 |
| 1095.95 | -0.019 |
| 1096.0 | -0.02 |
| 1096.05 | -0.02 |
| 1096.1 | -0.02 |
| 1096.15 | -0.019 |
| 1096.2 | -0.02 |
| 1096.25 | -0.02 |
| 1096.3 | -0.021 |
| 1096.35 | -0.022 |
| 1096.4 | -0.021 |
| 1096.45 | -0.02 |
| 1096.5 | -0.022 |
| 1096.55 | -0.022 |
| 1096.6 | -0.022 |
| 1096.65 | -0.023 |
| 1096.7 | -0.024 |
| 1096.75 | -0.024 |
| 1096.8 | -0.025 |
| 1096.85 | -0.024 |
| 1096.9 | -0.025 |
| 1096.95 | -0.026 |
| 1097.0 | -0.025 |
| 1097.05 | -0.024 |
| 1097.1 | -0.024 |
| 1097.15 | -0.023 |
| 1097.2 | -0.023 |
| 1097.25 | -0.022 |
| 1097.3 | -0.022 |
| 1097.35 | -0.021 |
| 1097.4 | -0.023 |
| 1097.45 | -0.023 |
| 1097.5 | -0.023 |
| 1097.55 | -0.023 |
| 1097.6 | -0.022 |
| 1097.65 | -0.023 |
| 1097.7 | -0.023 |
| 1097.75 | -0.024 |
| 1097.8 | -0.025 |
| 1097.85 | -0.024 |
| 1097.9 | -0.024 |
| 1097.95 | -0.024 |
| 1098.0 | -0.023 |
| 1098.05 | -0.024 |
| 1098.1 | -0.023 |
| 1098.15 | -0.023 |
| 1098.2 | -0.022 |
| 1098.25 | -0.022 |
| 1098.3 | -0.022 |
| 1098.35 | -0.022 |
| 1098.4 | -0.022 |
| 1098.45 | -0.023 |
| 1098.5 | -0.022 |
| 1098.55 | -0.024 |
| 1098.6 | -0.024 |
| 1098.65 | -0.024 |
| 1098.7 | -0.025 |
| 1098.75 | -0.025 |
| 1098.8 | -0.025 |
| 1098.85 | -0.027 |
| 1098.9 | -0.026 |
| 1098.95 | -0.027 |
| 1099.0 | -0.027 |
| 1099.05 | -0.026 |
| 1099.1 | -0.025 |
| 1099.15 | -0.025 |
| 1099.2 | -0.025 |
| 1099.25 | -0.025 |
| 1099.3 | -0.026 |
| 1099.35 | -0.026 |
| 1099.4 | -0.025 |
| 1099.45 | -0.027 |
| 1099.5 | -0.025 |
| 1099.55 | -0.026 |
| 1099.6 | -0.028 |
| 1099.65 | -0.029 |
| 1099.7 | -0.029 |
| 1099.75 | -0.029 |
| 1099.8 | -0.03 |
| 1099.85 | -0.03 |
| 1099.9 | -0.03 |
| 1099.95 | -0.03 |
| 1100.0 | -0.031 |